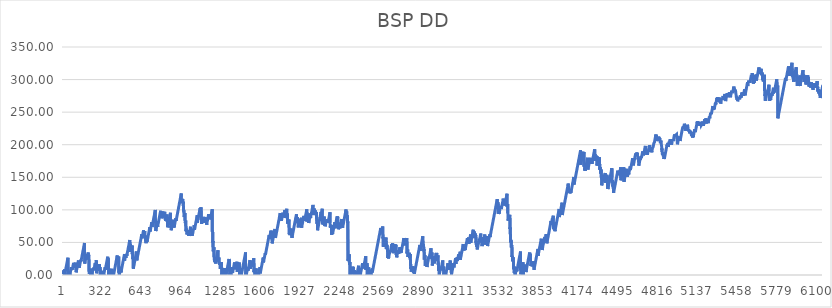
| Category | BSP DD |
|---|---|
| 0 | 1 |
| 1 | 2 |
| 2 | 3 |
| 3 | 4 |
| 4 | 5 |
| 5 | 6 |
| 6 | 7 |
| 7 | 8 |
| 8 | 4.51 |
| 9 | 5.51 |
| 10 | 6.51 |
| 11 | 7.51 |
| 12 | 8.51 |
| 13 | 0 |
| 14 | 1.057 |
| 15 | 2.113 |
| 16 | 3.113 |
| 17 | 4.113 |
| 18 | 5.113 |
| 19 | 6.113 |
| 20 | 7.113 |
| 21 | 8.113 |
| 22 | 9.113 |
| 23 | 10.113 |
| 24 | 11.113 |
| 25 | 12.113 |
| 26 | 13.113 |
| 27 | 14.113 |
| 28 | 15.113 |
| 29 | 16.113 |
| 30 | 17.113 |
| 31 | 18.113 |
| 32 | 19.113 |
| 33 | 20.113 |
| 34 | 21.113 |
| 35 | 22.113 |
| 36 | 23.221 |
| 37 | 24.329 |
| 38 | 25.437 |
| 39 | 26.545 |
| 40 | 0 |
| 41 | 1 |
| 42 | 2 |
| 43 | 3 |
| 44 | 4 |
| 45 | 5 |
| 46 | 6.035 |
| 47 | 0 |
| 48 | 1.035 |
| 49 | 2.07 |
| 50 | 3.122 |
| 51 | 4.175 |
| 52 | 0 |
| 53 | 1.052 |
| 54 | 2.084 |
| 55 | 0 |
| 56 | 1.032 |
| 57 | 2.064 |
| 58 | 3.096 |
| 59 | 4.096 |
| 60 | 5.096 |
| 61 | 6.096 |
| 62 | 7.096 |
| 63 | 8.096 |
| 64 | 9.096 |
| 65 | 10.096 |
| 66 | 11.096 |
| 67 | 12.096 |
| 68 | 13.096 |
| 69 | 7.719 |
| 70 | 8.743 |
| 71 | 9.766 |
| 72 | 10.766 |
| 73 | 11.766 |
| 74 | 12.766 |
| 75 | 8.591 |
| 76 | 9.596 |
| 77 | 10.601 |
| 78 | 11.606 |
| 79 | 12.606 |
| 80 | 13.606 |
| 81 | 14.606 |
| 82 | 15.606 |
| 83 | 16.606 |
| 84 | 17.606 |
| 85 | 18.606 |
| 86 | 19.606 |
| 87 | 12.586 |
| 88 | 13.606 |
| 89 | 14.626 |
| 90 | 15.646 |
| 91 | 10.963 |
| 92 | 11.971 |
| 93 | 12.978 |
| 94 | 13.986 |
| 95 | 14.986 |
| 96 | 15.986 |
| 97 | 16.986 |
| 98 | 17.986 |
| 99 | 18.986 |
| 100 | 13.806 |
| 101 | 14.816 |
| 102 | 15.826 |
| 103 | 16.836 |
| 104 | 17.88 |
| 105 | 18.924 |
| 106 | 4.208 |
| 107 | 5.252 |
| 108 | 6.296 |
| 109 | 7.296 |
| 110 | 8.296 |
| 111 | 9.296 |
| 112 | 10.296 |
| 113 | 11.296 |
| 114 | 12.296 |
| 115 | 13.296 |
| 116 | 14.296 |
| 117 | 15.296 |
| 118 | 16.296 |
| 119 | 17.296 |
| 120 | 18.296 |
| 121 | 19.296 |
| 122 | 20.296 |
| 123 | 21.296 |
| 124 | 22.296 |
| 125 | 15.706 |
| 126 | 16.716 |
| 127 | 17.726 |
| 128 | 18.736 |
| 129 | 19.746 |
| 130 | 20.768 |
| 131 | 11.29 |
| 132 | 12.312 |
| 133 | 13.334 |
| 134 | 14.356 |
| 135 | 15.356 |
| 136 | 16.356 |
| 137 | 17.356 |
| 138 | 18.356 |
| 139 | 19.356 |
| 140 | 20.356 |
| 141 | 21.356 |
| 142 | 22.356 |
| 143 | 23.356 |
| 144 | 24.356 |
| 145 | 20.966 |
| 146 | 21.976 |
| 147 | 22.986 |
| 148 | 23.986 |
| 149 | 24.986 |
| 150 | 25.986 |
| 151 | 26.986 |
| 152 | 27.986 |
| 153 | 28.986 |
| 154 | 29.986 |
| 155 | 30.986 |
| 156 | 31.986 |
| 157 | 32.986 |
| 158 | 33.986 |
| 159 | 34.986 |
| 160 | 35.986 |
| 161 | 36.986 |
| 162 | 37.986 |
| 163 | 38.986 |
| 164 | 39.986 |
| 165 | 40.986 |
| 166 | 41.986 |
| 167 | 42.986 |
| 168 | 43.986 |
| 169 | 44.986 |
| 170 | 45.986 |
| 171 | 46.986 |
| 172 | 48.136 |
| 173 | 49.286 |
| 174 | 50.436 |
| 175 | 17.586 |
| 176 | 18.586 |
| 177 | 19.586 |
| 178 | 20.586 |
| 179 | 21.586 |
| 180 | 22.586 |
| 181 | 23.586 |
| 182 | 24.586 |
| 183 | 25.586 |
| 184 | 26.586 |
| 185 | 27.586 |
| 186 | 28.586 |
| 187 | 29.586 |
| 188 | 24.072 |
| 189 | 25.078 |
| 190 | 26.084 |
| 191 | 27.09 |
| 192 | 28.096 |
| 193 | 29.096 |
| 194 | 30.096 |
| 195 | 31.096 |
| 196 | 32.096 |
| 197 | 28.496 |
| 198 | 29.496 |
| 199 | 30.496 |
| 200 | 31.496 |
| 201 | 32.496 |
| 202 | 33.496 |
| 203 | 34.496 |
| 204 | 26.903 |
| 205 | 27.939 |
| 206 | 28.976 |
| 207 | 30.096 |
| 208 | 31.216 |
| 209 | 32.336 |
| 210 | 5.216 |
| 211 | 6.223 |
| 212 | 1.731 |
| 213 | 2.738 |
| 214 | 3.746 |
| 215 | 4.746 |
| 216 | 5.746 |
| 217 | 6.746 |
| 218 | 7.746 |
| 219 | 8.746 |
| 220 | 9.746 |
| 221 | 10.831 |
| 222 | 1.656 |
| 223 | 2.704 |
| 224 | 0 |
| 225 | 1.048 |
| 226 | 2.096 |
| 227 | 3.144 |
| 228 | 0 |
| 229 | 1.016 |
| 230 | 2.032 |
| 231 | 3.048 |
| 232 | 4.06 |
| 233 | 0 |
| 234 | 1.012 |
| 235 | 2.025 |
| 236 | 3.025 |
| 237 | 4.025 |
| 238 | 5.025 |
| 239 | 6.025 |
| 240 | 7.025 |
| 241 | 8.025 |
| 242 | 9.025 |
| 243 | 10.025 |
| 244 | 7.29 |
| 245 | 8.305 |
| 246 | 9.305 |
| 247 | 10.305 |
| 248 | 11.305 |
| 249 | 12.305 |
| 250 | 8.295 |
| 251 | 9.295 |
| 252 | 10.295 |
| 253 | 11.295 |
| 254 | 12.295 |
| 255 | 13.295 |
| 256 | 14.295 |
| 257 | 15.295 |
| 258 | 16.295 |
| 259 | 17.295 |
| 260 | 18.295 |
| 261 | 14.468 |
| 262 | 15.482 |
| 263 | 16.495 |
| 264 | 17.495 |
| 265 | 18.495 |
| 266 | 19.495 |
| 267 | 20.495 |
| 268 | 21.495 |
| 269 | 22.585 |
| 270 | 23.675 |
| 271 | 2.755 |
| 272 | 3.845 |
| 273 | 4.845 |
| 274 | 5.845 |
| 275 | 6.845 |
| 276 | 7.845 |
| 277 | 8.845 |
| 278 | 9.845 |
| 279 | 10.845 |
| 280 | 11.845 |
| 281 | 12.845 |
| 282 | 13.845 |
| 283 | 14.863 |
| 284 | 6.481 |
| 285 | 7.499 |
| 286 | 8.517 |
| 287 | 9.535 |
| 288 | 10.535 |
| 289 | 11.535 |
| 290 | 12.535 |
| 291 | 13.535 |
| 292 | 14.535 |
| 293 | 15.553 |
| 294 | 16.571 |
| 295 | 8.189 |
| 296 | 9.207 |
| 297 | 10.225 |
| 298 | 11.309 |
| 299 | 12.393 |
| 300 | 13.477 |
| 301 | 0 |
| 302 | 1.084 |
| 303 | 2.084 |
| 304 | 3.084 |
| 305 | 0 |
| 306 | 1.014 |
| 307 | 2.028 |
| 308 | 3.042 |
| 309 | 4.056 |
| 310 | 5.316 |
| 311 | 6.576 |
| 312 | 0 |
| 313 | 0 |
| 314 | 1.006 |
| 315 | 2.012 |
| 316 | 3.018 |
| 317 | 4.024 |
| 318 | 0 |
| 319 | 1.02 |
| 320 | 2.04 |
| 321 | 3.06 |
| 322 | 4.18 |
| 323 | 0 |
| 324 | 1.12 |
| 325 | 2.185 |
| 326 | 3.25 |
| 327 | 4.315 |
| 328 | 0 |
| 329 | 1 |
| 330 | 2 |
| 331 | 3 |
| 332 | 4 |
| 333 | 5 |
| 334 | 6 |
| 335 | 7 |
| 336 | 8 |
| 337 | 9 |
| 338 | 10 |
| 339 | 11 |
| 340 | 12 |
| 341 | 8.113 |
| 342 | 9.127 |
| 343 | 10.14 |
| 344 | 11.14 |
| 345 | 12.14 |
| 346 | 13.14 |
| 347 | 14.14 |
| 348 | 15.14 |
| 349 | 16.14 |
| 350 | 17.14 |
| 351 | 18.14 |
| 352 | 19.14 |
| 353 | 20.14 |
| 354 | 21.14 |
| 355 | 22.14 |
| 356 | 23.14 |
| 357 | 24.14 |
| 358 | 25.14 |
| 359 | 26.14 |
| 360 | 27.14 |
| 361 | 28.14 |
| 362 | 21.373 |
| 363 | 22.407 |
| 364 | 23.44 |
| 365 | 24.63 |
| 366 | 25.82 |
| 367 | 27.01 |
| 368 | 0 |
| 369 | 1.034 |
| 370 | 2.068 |
| 371 | 3.102 |
| 372 | 0 |
| 373 | 1.034 |
| 374 | 2.044 |
| 375 | 0 |
| 376 | 1.01 |
| 377 | 2.02 |
| 378 | 3.03 |
| 379 | 4.03 |
| 380 | 5.03 |
| 381 | 6.03 |
| 382 | 7.03 |
| 383 | 8.04 |
| 384 | 1.65 |
| 385 | 2.66 |
| 386 | 3.67 |
| 387 | 4.68 |
| 388 | 5.68 |
| 389 | 6.68 |
| 390 | 7.68 |
| 391 | 8.68 |
| 392 | 9.68 |
| 393 | 10.76 |
| 394 | 1.84 |
| 395 | 2.84 |
| 396 | 3.84 |
| 397 | 4.84 |
| 398 | 5.84 |
| 399 | 6.868 |
| 400 | 0 |
| 401 | 1.028 |
| 402 | 2.056 |
| 403 | 3.084 |
| 404 | 4.141 |
| 405 | 5.199 |
| 406 | 0 |
| 407 | 1.058 |
| 408 | 0 |
| 409 | 1.02 |
| 410 | 2.04 |
| 411 | 3.04 |
| 412 | 4.04 |
| 413 | 5.04 |
| 414 | 6.04 |
| 415 | 7.04 |
| 416 | 8.04 |
| 417 | 9.04 |
| 418 | 10.04 |
| 419 | 11.04 |
| 420 | 12.04 |
| 421 | 13.04 |
| 422 | 14.04 |
| 423 | 15.04 |
| 424 | 16.04 |
| 425 | 17.04 |
| 426 | 18.04 |
| 427 | 19.04 |
| 428 | 20.04 |
| 429 | 21.04 |
| 430 | 22.04 |
| 431 | 23.04 |
| 432 | 24.04 |
| 433 | 25.04 |
| 434 | 26.04 |
| 435 | 27.04 |
| 436 | 28.04 |
| 437 | 29.04 |
| 438 | 30.04 |
| 439 | 18.062 |
| 440 | 19.094 |
| 441 | 20.126 |
| 442 | 21.158 |
| 443 | 22.19 |
| 444 | 23.19 |
| 445 | 24.19 |
| 446 | 25.19 |
| 447 | 26.278 |
| 448 | 27.366 |
| 449 | 28.454 |
| 450 | 29.542 |
| 451 | 3.63 |
| 452 | 4.63 |
| 453 | 5.63 |
| 454 | 6.63 |
| 455 | 0.445 |
| 456 | 1.46 |
| 457 | 2.475 |
| 458 | 3.49 |
| 459 | 4.49 |
| 460 | 5.49 |
| 461 | 6.49 |
| 462 | 7.49 |
| 463 | 8.49 |
| 464 | 9.49 |
| 465 | 10.49 |
| 466 | 11.49 |
| 467 | 12.565 |
| 468 | 4.04 |
| 469 | 5.04 |
| 470 | 6.04 |
| 471 | 7.04 |
| 472 | 8.04 |
| 473 | 9.04 |
| 474 | 10.04 |
| 475 | 11.04 |
| 476 | 12.04 |
| 477 | 13.04 |
| 478 | 14.04 |
| 479 | 15.04 |
| 480 | 16.04 |
| 481 | 17.04 |
| 482 | 18.04 |
| 483 | 19.04 |
| 484 | 20.04 |
| 485 | 21.04 |
| 486 | 22.04 |
| 487 | 23.04 |
| 488 | 24.04 |
| 489 | 25.04 |
| 490 | 26.04 |
| 491 | 27.04 |
| 492 | 28.04 |
| 493 | 29.04 |
| 494 | 30.04 |
| 495 | 31.04 |
| 496 | 32.064 |
| 497 | 22.088 |
| 498 | 23.112 |
| 499 | 24.136 |
| 500 | 25.16 |
| 501 | 26.16 |
| 502 | 27.16 |
| 503 | 28.16 |
| 504 | 29.16 |
| 505 | 30.16 |
| 506 | 31.16 |
| 507 | 26.37 |
| 508 | 27.38 |
| 509 | 28.39 |
| 510 | 29.4 |
| 511 | 30.4 |
| 512 | 31.4 |
| 513 | 32.4 |
| 514 | 33.402 |
| 515 | 29.715 |
| 516 | 30.717 |
| 517 | 31.72 |
| 518 | 32.72 |
| 519 | 33.72 |
| 520 | 34.72 |
| 521 | 35.72 |
| 522 | 36.72 |
| 523 | 37.72 |
| 524 | 38.72 |
| 525 | 39.72 |
| 526 | 40.72 |
| 527 | 41.72 |
| 528 | 42.72 |
| 529 | 43.72 |
| 530 | 44.72 |
| 531 | 45.72 |
| 532 | 46.72 |
| 533 | 47.72 |
| 534 | 48.72 |
| 535 | 49.72 |
| 536 | 50.72 |
| 537 | 51.72 |
| 538 | 52.72 |
| 539 | 53.752 |
| 540 | 54.785 |
| 541 | 45.317 |
| 542 | 46.35 |
| 543 | 47.417 |
| 544 | 35.483 |
| 545 | 36.55 |
| 546 | 37.55 |
| 547 | 38.55 |
| 548 | 39.55 |
| 549 | 40.55 |
| 550 | 41.55 |
| 551 | 42.55 |
| 552 | 39.25 |
| 553 | 40.25 |
| 554 | 41.25 |
| 555 | 42.25 |
| 556 | 43.25 |
| 557 | 44.288 |
| 558 | 45.326 |
| 559 | 32.064 |
| 560 | 33.102 |
| 561 | 34.14 |
| 562 | 35.172 |
| 563 | 36.204 |
| 564 | 24.386 |
| 565 | 25.418 |
| 566 | 26.45 |
| 567 | 27.506 |
| 568 | 9.802 |
| 569 | 10.858 |
| 570 | 11.914 |
| 571 | 12.97 |
| 572 | 13.97 |
| 573 | 14.97 |
| 574 | 15.97 |
| 575 | 16.97 |
| 576 | 17.97 |
| 577 | 18.97 |
| 578 | 19.97 |
| 579 | 20.97 |
| 580 | 21.97 |
| 581 | 22.97 |
| 582 | 23.97 |
| 583 | 24.97 |
| 584 | 25.97 |
| 585 | 26.97 |
| 586 | 27.97 |
| 587 | 28.97 |
| 588 | 29.97 |
| 589 | 30.97 |
| 590 | 31.97 |
| 591 | 32.97 |
| 592 | 33.97 |
| 593 | 34.97 |
| 594 | 36.028 |
| 595 | 37.085 |
| 596 | 22.542 |
| 597 | 23.6 |
| 598 | 24.6 |
| 599 | 25.6 |
| 600 | 26.6 |
| 601 | 27.6 |
| 602 | 28.6 |
| 603 | 29.6 |
| 604 | 30.6 |
| 605 | 31.6 |
| 606 | 32.6 |
| 607 | 33.6 |
| 608 | 34.6 |
| 609 | 35.6 |
| 610 | 36.6 |
| 611 | 37.6 |
| 612 | 38.6 |
| 613 | 39.6 |
| 614 | 40.6 |
| 615 | 41.6 |
| 616 | 42.6 |
| 617 | 43.6 |
| 618 | 44.6 |
| 619 | 45.6 |
| 620 | 46.6 |
| 621 | 47.6 |
| 622 | 48.6 |
| 623 | 49.6 |
| 624 | 50.6 |
| 625 | 51.6 |
| 626 | 52.6 |
| 627 | 53.6 |
| 628 | 54.6 |
| 629 | 55.6 |
| 630 | 56.6 |
| 631 | 57.6 |
| 632 | 58.6 |
| 633 | 59.6 |
| 634 | 60.6 |
| 635 | 61.6 |
| 636 | 62.6 |
| 637 | 63.62 |
| 638 | 56.44 |
| 639 | 57.46 |
| 640 | 58.48 |
| 641 | 59.48 |
| 642 | 60.48 |
| 643 | 61.48 |
| 644 | 62.48 |
| 645 | 63.48 |
| 646 | 64.48 |
| 647 | 65.48 |
| 648 | 66.48 |
| 649 | 67.48 |
| 650 | 68.515 |
| 651 | 69.55 |
| 652 | 59.565 |
| 653 | 60.6 |
| 654 | 61.6 |
| 655 | 62.6 |
| 656 | 63.6 |
| 657 | 64.6 |
| 658 | 65.6 |
| 659 | 66.62 |
| 660 | 67.64 |
| 661 | 58.66 |
| 662 | 59.68 |
| 663 | 60.7 |
| 664 | 57.94 |
| 665 | 58.96 |
| 666 | 59.988 |
| 667 | 51.745 |
| 668 | 52.772 |
| 669 | 53.8 |
| 670 | 48.93 |
| 671 | 49.94 |
| 672 | 50.95 |
| 673 | 51.96 |
| 674 | 52.96 |
| 675 | 53.96 |
| 676 | 54.96 |
| 677 | 55.96 |
| 678 | 56.96 |
| 679 | 51.372 |
| 680 | 52.385 |
| 681 | 53.398 |
| 682 | 54.41 |
| 683 | 55.41 |
| 684 | 56.41 |
| 685 | 57.41 |
| 686 | 58.41 |
| 687 | 59.41 |
| 688 | 60.41 |
| 689 | 61.41 |
| 690 | 62.41 |
| 691 | 63.41 |
| 692 | 64.41 |
| 693 | 65.41 |
| 694 | 66.41 |
| 695 | 67.41 |
| 696 | 68.41 |
| 697 | 69.41 |
| 698 | 70.41 |
| 699 | 71.41 |
| 700 | 72.41 |
| 701 | 73.41 |
| 702 | 74.447 |
| 703 | 66.883 |
| 704 | 67.92 |
| 705 | 68.92 |
| 706 | 69.92 |
| 707 | 70.92 |
| 708 | 71.92 |
| 709 | 72.92 |
| 710 | 73.92 |
| 711 | 74.92 |
| 712 | 75.92 |
| 713 | 76.92 |
| 714 | 77.92 |
| 715 | 78.92 |
| 716 | 79.92 |
| 717 | 80.936 |
| 718 | 81.952 |
| 719 | 73.738 |
| 720 | 74.754 |
| 721 | 75.77 |
| 722 | 76.77 |
| 723 | 77.77 |
| 724 | 78.77 |
| 725 | 79.77 |
| 726 | 80.77 |
| 727 | 81.77 |
| 728 | 82.77 |
| 729 | 83.77 |
| 730 | 84.77 |
| 731 | 85.77 |
| 732 | 86.77 |
| 733 | 87.77 |
| 734 | 88.77 |
| 735 | 89.77 |
| 736 | 90.77 |
| 737 | 91.77 |
| 738 | 92.77 |
| 739 | 93.77 |
| 740 | 94.77 |
| 741 | 95.77 |
| 742 | 96.77 |
| 743 | 97.77 |
| 744 | 98.77 |
| 745 | 99.96 |
| 746 | 80.15 |
| 747 | 81.237 |
| 748 | 82.323 |
| 749 | 67.41 |
| 750 | 68.41 |
| 751 | 69.41 |
| 752 | 70.41 |
| 753 | 71.41 |
| 754 | 72.41 |
| 755 | 73.41 |
| 756 | 74.41 |
| 757 | 75.41 |
| 758 | 76.41 |
| 759 | 77.41 |
| 760 | 78.41 |
| 761 | 79.41 |
| 762 | 80.41 |
| 763 | 81.422 |
| 764 | 74.524 |
| 765 | 75.536 |
| 766 | 76.548 |
| 767 | 77.56 |
| 768 | 78.56 |
| 769 | 79.56 |
| 770 | 80.56 |
| 771 | 81.56 |
| 772 | 82.56 |
| 773 | 83.56 |
| 774 | 84.56 |
| 775 | 85.56 |
| 776 | 86.56 |
| 777 | 87.56 |
| 778 | 88.56 |
| 779 | 89.56 |
| 780 | 90.56 |
| 781 | 91.56 |
| 782 | 92.56 |
| 783 | 93.56 |
| 784 | 94.56 |
| 785 | 95.56 |
| 786 | 96.56 |
| 787 | 97.56 |
| 788 | 98.56 |
| 789 | 99.56 |
| 790 | 93.1 |
| 791 | 94.11 |
| 792 | 95.12 |
| 793 | 96.13 |
| 794 | 97.14 |
| 795 | 98.168 |
| 796 | 87.196 |
| 797 | 88.224 |
| 798 | 89.252 |
| 799 | 90.28 |
| 800 | 91.28 |
| 801 | 92.28 |
| 802 | 93.28 |
| 803 | 94.28 |
| 804 | 95.28 |
| 805 | 96.3 |
| 806 | 97.32 |
| 807 | 88.5 |
| 808 | 89.52 |
| 809 | 90.54 |
| 810 | 91.54 |
| 811 | 92.54 |
| 812 | 93.54 |
| 813 | 94.54 |
| 814 | 95.54 |
| 815 | 96.54 |
| 816 | 97.54 |
| 817 | 93.042 |
| 818 | 94.044 |
| 819 | 95.046 |
| 820 | 96.048 |
| 821 | 97.05 |
| 822 | 88.673 |
| 823 | 89.717 |
| 824 | 90.76 |
| 825 | 85.34 |
| 826 | 86.35 |
| 827 | 87.36 |
| 828 | 88.37 |
| 829 | 82.916 |
| 830 | 83.922 |
| 831 | 84.928 |
| 832 | 85.934 |
| 833 | 86.94 |
| 834 | 87.94 |
| 835 | 88.94 |
| 836 | 89.94 |
| 837 | 90.94 |
| 838 | 91.974 |
| 839 | 93.008 |
| 840 | 94.042 |
| 841 | 81.596 |
| 842 | 82.63 |
| 843 | 83.66 |
| 844 | 84.69 |
| 845 | 73.22 |
| 846 | 74.25 |
| 847 | 75.28 |
| 848 | 76.28 |
| 849 | 77.28 |
| 850 | 78.28 |
| 851 | 79.28 |
| 852 | 80.28 |
| 853 | 81.28 |
| 854 | 82.28 |
| 855 | 83.28 |
| 856 | 84.28 |
| 857 | 85.28 |
| 858 | 86.28 |
| 859 | 87.28 |
| 860 | 88.28 |
| 861 | 89.28 |
| 862 | 90.28 |
| 863 | 91.28 |
| 864 | 92.33 |
| 865 | 93.38 |
| 866 | 94.43 |
| 867 | 95.48 |
| 868 | 78.88 |
| 869 | 79.9 |
| 870 | 73.12 |
| 871 | 74.14 |
| 872 | 75.16 |
| 873 | 76.174 |
| 874 | 68.808 |
| 875 | 69.822 |
| 876 | 70.836 |
| 877 | 71.85 |
| 878 | 72.85 |
| 879 | 73.85 |
| 880 | 74.85 |
| 881 | 75.85 |
| 882 | 76.85 |
| 883 | 77.85 |
| 884 | 78.85 |
| 885 | 79.85 |
| 886 | 80.85 |
| 887 | 81.85 |
| 888 | 82.85 |
| 889 | 83.85 |
| 890 | 84.85 |
| 891 | 85.85 |
| 892 | 73.384 |
| 893 | 74.418 |
| 894 | 75.452 |
| 895 | 76.486 |
| 896 | 77.52 |
| 897 | 73.128 |
| 898 | 74.135 |
| 899 | 75.143 |
| 900 | 76.15 |
| 901 | 77.15 |
| 902 | 78.15 |
| 903 | 79.15 |
| 904 | 80.15 |
| 905 | 81.15 |
| 906 | 82.15 |
| 907 | 83.15 |
| 908 | 84.15 |
| 909 | 85.15 |
| 910 | 86.15 |
| 911 | 87.15 |
| 912 | 88.15 |
| 913 | 83.12 |
| 914 | 84.13 |
| 915 | 85.14 |
| 916 | 86.15 |
| 917 | 87.15 |
| 918 | 88.15 |
| 919 | 89.15 |
| 920 | 90.15 |
| 921 | 91.15 |
| 922 | 92.15 |
| 923 | 93.15 |
| 924 | 94.15 |
| 925 | 95.15 |
| 926 | 96.15 |
| 927 | 97.15 |
| 928 | 98.15 |
| 929 | 99.15 |
| 930 | 100.15 |
| 931 | 101.15 |
| 932 | 102.15 |
| 933 | 103.15 |
| 934 | 104.15 |
| 935 | 105.15 |
| 936 | 106.15 |
| 937 | 107.15 |
| 938 | 108.15 |
| 939 | 109.15 |
| 940 | 110.15 |
| 941 | 111.15 |
| 942 | 112.15 |
| 943 | 113.15 |
| 944 | 114.15 |
| 945 | 115.15 |
| 946 | 116.15 |
| 947 | 117.15 |
| 948 | 118.15 |
| 949 | 119.15 |
| 950 | 120.15 |
| 951 | 121.15 |
| 952 | 122.15 |
| 953 | 123.15 |
| 954 | 124.15 |
| 955 | 125.196 |
| 956 | 110.742 |
| 957 | 111.788 |
| 958 | 112.834 |
| 959 | 113.834 |
| 960 | 114.834 |
| 961 | 115.834 |
| 962 | 116.834 |
| 963 | 112.376 |
| 964 | 113.378 |
| 965 | 114.38 |
| 966 | 115.382 |
| 967 | 116.384 |
| 968 | 117.398 |
| 969 | 109.932 |
| 970 | 110.946 |
| 971 | 111.96 |
| 972 | 112.974 |
| 973 | 97.861 |
| 974 | 98.947 |
| 975 | 100.034 |
| 976 | 101.084 |
| 977 | 94.914 |
| 978 | 88.899 |
| 979 | 89.914 |
| 980 | 90.929 |
| 981 | 91.944 |
| 982 | 92.98 |
| 983 | 94.016 |
| 984 | 95.052 |
| 985 | 96.088 |
| 986 | 83.344 |
| 987 | 79.624 |
| 988 | 80.624 |
| 989 | 81.624 |
| 990 | 82.624 |
| 991 | 83.624 |
| 992 | 84.686 |
| 993 | 67.078 |
| 994 | 68.14 |
| 995 | 69.14 |
| 996 | 70.14 |
| 997 | 71.14 |
| 998 | 66.29 |
| 999 | 67.3 |
| 1000 | 68.31 |
| 1001 | 69.32 |
| 1002 | 62.332 |
| 1003 | 63.344 |
| 1004 | 64.356 |
| 1005 | 65.368 |
| 1006 | 66.38 |
| 1007 | 67.38 |
| 1008 | 68.38 |
| 1009 | 69.38 |
| 1010 | 64.962 |
| 1011 | 65.964 |
| 1012 | 66.966 |
| 1013 | 67.968 |
| 1014 | 68.97 |
| 1015 | 69.994 |
| 1016 | 60.018 |
| 1017 | 61.042 |
| 1018 | 62.066 |
| 1019 | 63.09 |
| 1020 | 64.09 |
| 1021 | 65.09 |
| 1022 | 66.09 |
| 1023 | 67.09 |
| 1024 | 68.09 |
| 1025 | 69.09 |
| 1026 | 70.09 |
| 1027 | 71.09 |
| 1028 | 72.09 |
| 1029 | 73.13 |
| 1030 | 74.17 |
| 1031 | 60.25 |
| 1032 | 61.29 |
| 1033 | 62.33 |
| 1034 | 63.33 |
| 1035 | 64.33 |
| 1036 | 65.33 |
| 1037 | 66.33 |
| 1038 | 67.33 |
| 1039 | 62.792 |
| 1040 | 63.794 |
| 1041 | 64.796 |
| 1042 | 65.798 |
| 1043 | 66.8 |
| 1044 | 60.51 |
| 1045 | 61.52 |
| 1046 | 62.53 |
| 1047 | 63.54 |
| 1048 | 64.55 |
| 1049 | 65.55 |
| 1050 | 66.55 |
| 1051 | 67.55 |
| 1052 | 68.55 |
| 1053 | 69.55 |
| 1054 | 70.55 |
| 1055 | 71.55 |
| 1056 | 72.55 |
| 1057 | 73.55 |
| 1058 | 74.55 |
| 1059 | 75.55 |
| 1060 | 76.55 |
| 1061 | 77.566 |
| 1062 | 69.702 |
| 1063 | 70.718 |
| 1064 | 71.734 |
| 1065 | 72.75 |
| 1066 | 73.75 |
| 1067 | 74.75 |
| 1068 | 75.75 |
| 1069 | 76.75 |
| 1070 | 77.75 |
| 1071 | 78.75 |
| 1072 | 79.75 |
| 1073 | 80.75 |
| 1074 | 81.75 |
| 1075 | 82.75 |
| 1076 | 83.75 |
| 1077 | 84.75 |
| 1078 | 85.75 |
| 1079 | 86.75 |
| 1080 | 87.75 |
| 1081 | 88.75 |
| 1082 | 89.75 |
| 1083 | 90.75 |
| 1084 | 91.75 |
| 1085 | 80.4 |
| 1086 | 81.43 |
| 1087 | 82.46 |
| 1088 | 83.49 |
| 1089 | 84.52 |
| 1090 | 85.52 |
| 1091 | 86.52 |
| 1092 | 87.52 |
| 1093 | 88.52 |
| 1094 | 89.52 |
| 1095 | 90.52 |
| 1096 | 91.52 |
| 1097 | 92.52 |
| 1098 | 93.52 |
| 1099 | 94.52 |
| 1100 | 95.52 |
| 1101 | 96.52 |
| 1102 | 97.52 |
| 1103 | 98.52 |
| 1104 | 99.52 |
| 1105 | 100.52 |
| 1106 | 101.52 |
| 1107 | 102.52 |
| 1108 | 103.52 |
| 1109 | 97.735 |
| 1110 | 98.75 |
| 1111 | 99.765 |
| 1112 | 100.78 |
| 1113 | 101.78 |
| 1114 | 102.78 |
| 1115 | 103.86 |
| 1116 | 84.7 |
| 1117 | 85.78 |
| 1118 | 86.86 |
| 1119 | 78.503 |
| 1120 | 79.547 |
| 1121 | 80.59 |
| 1122 | 81.59 |
| 1123 | 82.59 |
| 1124 | 83.59 |
| 1125 | 84.59 |
| 1126 | 85.59 |
| 1127 | 86.59 |
| 1128 | 87.59 |
| 1129 | 81.198 |
| 1130 | 82.215 |
| 1131 | 83.233 |
| 1132 | 84.25 |
| 1133 | 85.25 |
| 1134 | 86.25 |
| 1135 | 87.25 |
| 1136 | 88.25 |
| 1137 | 89.25 |
| 1138 | 90.278 |
| 1139 | 80.256 |
| 1140 | 81.284 |
| 1141 | 82.312 |
| 1142 | 83.312 |
| 1143 | 84.312 |
| 1144 | 85.312 |
| 1145 | 86.312 |
| 1146 | 87.312 |
| 1147 | 88.339 |
| 1148 | 82.165 |
| 1149 | 83.192 |
| 1150 | 84.192 |
| 1151 | 85.192 |
| 1152 | 86.192 |
| 1153 | 87.192 |
| 1154 | 88.192 |
| 1155 | 89.212 |
| 1156 | 80.212 |
| 1157 | 81.232 |
| 1158 | 82.252 |
| 1159 | 83.272 |
| 1160 | 77.322 |
| 1161 | 78.372 |
| 1162 | 79.372 |
| 1163 | 80.372 |
| 1164 | 81.372 |
| 1165 | 82.372 |
| 1166 | 83.372 |
| 1167 | 84.372 |
| 1168 | 85.372 |
| 1169 | 86.372 |
| 1170 | 87.372 |
| 1171 | 88.372 |
| 1172 | 89.372 |
| 1173 | 90.372 |
| 1174 | 91.372 |
| 1175 | 92.372 |
| 1176 | 93.372 |
| 1177 | 94.388 |
| 1178 | 86.264 |
| 1179 | 87.28 |
| 1180 | 88.296 |
| 1181 | 89.312 |
| 1182 | 90.312 |
| 1183 | 91.312 |
| 1184 | 92.312 |
| 1185 | 85.434 |
| 1186 | 86.446 |
| 1187 | 87.458 |
| 1188 | 88.47 |
| 1189 | 89.482 |
| 1190 | 90.482 |
| 1191 | 91.482 |
| 1192 | 92.482 |
| 1193 | 88.567 |
| 1194 | 89.572 |
| 1195 | 90.577 |
| 1196 | 91.582 |
| 1197 | 92.582 |
| 1198 | 93.582 |
| 1199 | 94.582 |
| 1200 | 95.582 |
| 1201 | 96.582 |
| 1202 | 97.706 |
| 1203 | 98.83 |
| 1204 | 99.954 |
| 1205 | 101.078 |
| 1206 | 66.252 |
| 1207 | 67.31 |
| 1208 | 68.368 |
| 1209 | 50.036 |
| 1210 | 51.094 |
| 1211 | 52.152 |
| 1212 | 53.222 |
| 1213 | 36.292 |
| 1214 | 37.362 |
| 1215 | 38.432 |
| 1216 | 39.476 |
| 1217 | 40.52 |
| 1218 | 41.564 |
| 1219 | 42.608 |
| 1220 | 27.652 |
| 1221 | 28.658 |
| 1222 | 22.974 |
| 1223 | 23.98 |
| 1224 | 24.986 |
| 1225 | 25.992 |
| 1226 | 19.562 |
| 1227 | 20.572 |
| 1228 | 21.582 |
| 1229 | 22.592 |
| 1230 | 23.602 |
| 1231 | 17.81 |
| 1232 | 18.818 |
| 1233 | 19.826 |
| 1234 | 20.834 |
| 1235 | 21.842 |
| 1236 | 22.842 |
| 1237 | 23.842 |
| 1238 | 24.842 |
| 1239 | 25.842 |
| 1240 | 26.842 |
| 1241 | 27.842 |
| 1242 | 28.842 |
| 1243 | 29.842 |
| 1244 | 30.842 |
| 1245 | 31.842 |
| 1246 | 32.842 |
| 1247 | 33.842 |
| 1248 | 34.842 |
| 1249 | 35.9 |
| 1250 | 36.958 |
| 1251 | 38.016 |
| 1252 | 39.074 |
| 1253 | 20.842 |
| 1254 | 21.842 |
| 1255 | 22.842 |
| 1256 | 23.842 |
| 1257 | 24.842 |
| 1258 | 25.842 |
| 1259 | 26.87 |
| 1260 | 27.898 |
| 1261 | 17.006 |
| 1262 | 18.034 |
| 1263 | 19.062 |
| 1264 | 15.342 |
| 1265 | 16.342 |
| 1266 | 17.342 |
| 1267 | 18.342 |
| 1268 | 19.342 |
| 1269 | 20.37 |
| 1270 | 9.528 |
| 1271 | 10.556 |
| 1272 | 11.584 |
| 1273 | 12.612 |
| 1274 | 13.612 |
| 1275 | 14.612 |
| 1276 | 15.612 |
| 1277 | 16.612 |
| 1278 | 17.612 |
| 1279 | 18.797 |
| 1280 | 19.982 |
| 1281 | 21.167 |
| 1282 | 0 |
| 1283 | 1.12 |
| 1284 | 2.24 |
| 1285 | 0 |
| 1286 | 1.12 |
| 1287 | 2.12 |
| 1288 | 3.12 |
| 1289 | 4.12 |
| 1290 | 5.12 |
| 1291 | 6.12 |
| 1292 | 7.168 |
| 1293 | 8.216 |
| 1294 | 9.264 |
| 1295 | 0 |
| 1296 | 1.048 |
| 1297 | 2.048 |
| 1298 | 3.048 |
| 1299 | 4.048 |
| 1300 | 5.048 |
| 1301 | 6.048 |
| 1302 | 7.148 |
| 1303 | 8.248 |
| 1304 | 9.348 |
| 1305 | 10.448 |
| 1306 | 0 |
| 1307 | 1 |
| 1308 | 2 |
| 1309 | 3 |
| 1310 | 4 |
| 1311 | 5 |
| 1312 | 6 |
| 1313 | 7 |
| 1314 | 8 |
| 1315 | 9.032 |
| 1316 | 10.065 |
| 1317 | 0.637 |
| 1318 | 1.67 |
| 1319 | 2.67 |
| 1320 | 3.67 |
| 1321 | 4.67 |
| 1322 | 5.67 |
| 1323 | 6.67 |
| 1324 | 7.67 |
| 1325 | 8.67 |
| 1326 | 9.67 |
| 1327 | 10.67 |
| 1328 | 11.67 |
| 1329 | 12.67 |
| 1330 | 13.67 |
| 1331 | 14.67 |
| 1332 | 15.67 |
| 1333 | 16.67 |
| 1334 | 17.67 |
| 1335 | 18.67 |
| 1336 | 19.67 |
| 1337 | 20.67 |
| 1338 | 21.67 |
| 1339 | 22.67 |
| 1340 | 23.67 |
| 1341 | 24.67 |
| 1342 | 21.18 |
| 1343 | 22.19 |
| 1344 | 23.2 |
| 1345 | 24.455 |
| 1346 | 0 |
| 1347 | 1.032 |
| 1348 | 2.064 |
| 1349 | 0 |
| 1350 | 1.032 |
| 1351 | 2.064 |
| 1352 | 3.124 |
| 1353 | 4.184 |
| 1354 | 0 |
| 1355 | 1.06 |
| 1356 | 0 |
| 1357 | 1.002 |
| 1358 | 2.005 |
| 1359 | 3.007 |
| 1360 | 4.007 |
| 1361 | 5.007 |
| 1362 | 6.007 |
| 1363 | 7.007 |
| 1364 | 8.007 |
| 1365 | 9.007 |
| 1366 | 10.007 |
| 1367 | 11.007 |
| 1368 | 12.027 |
| 1369 | 3.188 |
| 1370 | 4.207 |
| 1371 | 5.227 |
| 1372 | 6.247 |
| 1373 | 7.247 |
| 1374 | 8.247 |
| 1375 | 9.247 |
| 1376 | 10.247 |
| 1377 | 11.247 |
| 1378 | 12.247 |
| 1379 | 13.247 |
| 1380 | 14.247 |
| 1381 | 15.247 |
| 1382 | 16.247 |
| 1383 | 17.273 |
| 1384 | 18.299 |
| 1385 | 19.325 |
| 1386 | 8.962 |
| 1387 | 9.988 |
| 1388 | 10.988 |
| 1389 | 11.988 |
| 1390 | 12.988 |
| 1391 | 13.988 |
| 1392 | 14.988 |
| 1393 | 15.988 |
| 1394 | 16.988 |
| 1395 | 17.988 |
| 1396 | 18.988 |
| 1397 | 16.341 |
| 1398 | 17.344 |
| 1399 | 18.348 |
| 1400 | 14.248 |
| 1401 | 15.248 |
| 1402 | 16.247 |
| 1403 | 17.248 |
| 1404 | 18.248 |
| 1405 | 19.293 |
| 1406 | 20.339 |
| 1407 | 4.885 |
| 1408 | 5.931 |
| 1409 | 6.977 |
| 1410 | 4.907 |
| 1411 | 5.907 |
| 1412 | 6.907 |
| 1413 | 7.907 |
| 1414 | 8.907 |
| 1415 | 9.907 |
| 1416 | 10.907 |
| 1417 | 11.907 |
| 1418 | 12.907 |
| 1419 | 13.907 |
| 1420 | 14.907 |
| 1421 | 16.005 |
| 1422 | 17.103 |
| 1423 | 18.202 |
| 1424 | 19.3 |
| 1425 | 0 |
| 1426 | 1.078 |
| 1427 | 2.156 |
| 1428 | 3.234 |
| 1429 | 0 |
| 1430 | 1.078 |
| 1431 | 0 |
| 1432 | 1.04 |
| 1433 | 2.08 |
| 1434 | 3.12 |
| 1435 | 4.19 |
| 1436 | 0 |
| 1437 | 1 |
| 1438 | 2 |
| 1439 | 3 |
| 1440 | 0 |
| 1441 | 1.01 |
| 1442 | 2.02 |
| 1443 | 3.02 |
| 1444 | 4.02 |
| 1445 | 5.02 |
| 1446 | 6.02 |
| 1447 | 7.02 |
| 1448 | 8.02 |
| 1449 | 9.02 |
| 1450 | 10.02 |
| 1451 | 11.02 |
| 1452 | 12.02 |
| 1453 | 13.02 |
| 1454 | 14.02 |
| 1455 | 15.02 |
| 1456 | 16.02 |
| 1457 | 17.02 |
| 1458 | 18.02 |
| 1459 | 19.02 |
| 1460 | 20.02 |
| 1461 | 21.02 |
| 1462 | 22.02 |
| 1463 | 23.02 |
| 1464 | 24.02 |
| 1465 | 25.02 |
| 1466 | 26.02 |
| 1467 | 27.02 |
| 1468 | 28.02 |
| 1469 | 29.02 |
| 1470 | 30.02 |
| 1471 | 31.02 |
| 1472 | 32.02 |
| 1473 | 33.37 |
| 1474 | 34.72 |
| 1475 | 0 |
| 1476 | 1 |
| 1477 | 2 |
| 1478 | 3 |
| 1479 | 4 |
| 1480 | 0 |
| 1481 | 1.008 |
| 1482 | 2.016 |
| 1483 | 3.024 |
| 1484 | 4.032 |
| 1485 | 5.032 |
| 1486 | 6.032 |
| 1487 | 7.032 |
| 1488 | 8.032 |
| 1489 | 9.032 |
| 1490 | 10.032 |
| 1491 | 11.032 |
| 1492 | 12.032 |
| 1493 | 13.032 |
| 1494 | 6.762 |
| 1495 | 7.772 |
| 1496 | 8.782 |
| 1497 | 9.792 |
| 1498 | 10.802 |
| 1499 | 11.802 |
| 1500 | 12.802 |
| 1501 | 13.802 |
| 1502 | 14.802 |
| 1503 | 15.802 |
| 1504 | 16.802 |
| 1505 | 17.802 |
| 1506 | 18.802 |
| 1507 | 19.802 |
| 1508 | 20.802 |
| 1509 | 21.802 |
| 1510 | 22.844 |
| 1511 | 23.886 |
| 1512 | 9.428 |
| 1513 | 10.47 |
| 1514 | 11.512 |
| 1515 | 12.512 |
| 1516 | 13.512 |
| 1517 | 14.512 |
| 1518 | 15.512 |
| 1519 | 16.512 |
| 1520 | 17.512 |
| 1521 | 18.512 |
| 1522 | 19.512 |
| 1523 | 20.512 |
| 1524 | 21.53 |
| 1525 | 13.108 |
| 1526 | 14.126 |
| 1527 | 15.144 |
| 1528 | 16.162 |
| 1529 | 13.585 |
| 1530 | 14.589 |
| 1531 | 15.592 |
| 1532 | 16.592 |
| 1533 | 17.592 |
| 1534 | 18.592 |
| 1535 | 19.592 |
| 1536 | 20.592 |
| 1537 | 21.592 |
| 1538 | 22.592 |
| 1539 | 23.684 |
| 1540 | 24.777 |
| 1541 | 25.869 |
| 1542 | 4.372 |
| 1543 | 5.372 |
| 1544 | 6.372 |
| 1545 | 7.372 |
| 1546 | 8.372 |
| 1547 | 9.372 |
| 1548 | 10.562 |
| 1549 | 11.752 |
| 1550 | 0 |
| 1551 | 1 |
| 1552 | 2 |
| 1553 | 3 |
| 1554 | 4 |
| 1555 | 5 |
| 1556 | 6 |
| 1557 | 7 |
| 1558 | 8.043 |
| 1559 | 9.085 |
| 1560 | 10.128 |
| 1561 | 0 |
| 1562 | 1 |
| 1563 | 2 |
| 1564 | 3 |
| 1565 | 4 |
| 1566 | 5.18 |
| 1567 | 0 |
| 1568 | 1 |
| 1569 | 2 |
| 1570 | 3 |
| 1571 | 4 |
| 1572 | 5 |
| 1573 | 0.01 |
| 1574 | 1.02 |
| 1575 | 2.03 |
| 1576 | 3.04 |
| 1577 | 4.092 |
| 1578 | 5.144 |
| 1579 | 0 |
| 1580 | 1.052 |
| 1581 | 2.104 |
| 1582 | 3.104 |
| 1583 | 4.104 |
| 1584 | 5.104 |
| 1585 | 6.104 |
| 1586 | 7.104 |
| 1587 | 8.104 |
| 1588 | 9.104 |
| 1589 | 10.104 |
| 1590 | 11.104 |
| 1591 | 12.104 |
| 1592 | 13.13 |
| 1593 | 2.656 |
| 1594 | 3.682 |
| 1595 | 4.708 |
| 1596 | 5.734 |
| 1597 | 6.734 |
| 1598 | 7.734 |
| 1599 | 8.734 |
| 1600 | 9.734 |
| 1601 | 10.734 |
| 1602 | 11.734 |
| 1603 | 12.734 |
| 1604 | 13.734 |
| 1605 | 14.734 |
| 1606 | 15.734 |
| 1607 | 16.734 |
| 1608 | 17.734 |
| 1609 | 18.734 |
| 1610 | 19.734 |
| 1611 | 20.734 |
| 1612 | 21.734 |
| 1613 | 22.734 |
| 1614 | 23.734 |
| 1615 | 24.734 |
| 1616 | 25.734 |
| 1617 | 26.752 |
| 1618 | 27.77 |
| 1619 | 19.468 |
| 1620 | 20.486 |
| 1621 | 21.504 |
| 1622 | 22.504 |
| 1623 | 23.504 |
| 1624 | 24.504 |
| 1625 | 25.504 |
| 1626 | 26.504 |
| 1627 | 27.504 |
| 1628 | 28.504 |
| 1629 | 29.504 |
| 1630 | 30.504 |
| 1631 | 31.504 |
| 1632 | 32.504 |
| 1633 | 33.504 |
| 1634 | 34.504 |
| 1635 | 31.424 |
| 1636 | 32.444 |
| 1637 | 33.444 |
| 1638 | 34.444 |
| 1639 | 35.444 |
| 1640 | 36.444 |
| 1641 | 37.444 |
| 1642 | 38.444 |
| 1643 | 39.444 |
| 1644 | 40.444 |
| 1645 | 41.444 |
| 1646 | 42.444 |
| 1647 | 43.444 |
| 1648 | 44.444 |
| 1649 | 45.444 |
| 1650 | 46.444 |
| 1651 | 47.444 |
| 1652 | 48.444 |
| 1653 | 49.444 |
| 1654 | 50.444 |
| 1655 | 51.444 |
| 1656 | 52.444 |
| 1657 | 53.444 |
| 1658 | 54.444 |
| 1659 | 55.444 |
| 1660 | 56.444 |
| 1661 | 57.444 |
| 1662 | 58.444 |
| 1663 | 59.444 |
| 1664 | 60.444 |
| 1665 | 61.444 |
| 1666 | 62.444 |
| 1667 | 55.854 |
| 1668 | 56.864 |
| 1669 | 57.874 |
| 1670 | 58.884 |
| 1671 | 59.894 |
| 1672 | 60.894 |
| 1673 | 61.894 |
| 1674 | 62.894 |
| 1675 | 63.894 |
| 1676 | 64.894 |
| 1677 | 65.894 |
| 1678 | 66.894 |
| 1679 | 67.969 |
| 1680 | 59.734 |
| 1681 | 60.734 |
| 1682 | 61.734 |
| 1683 | 62.734 |
| 1684 | 63.734 |
| 1685 | 64.734 |
| 1686 | 65.796 |
| 1687 | 66.858 |
| 1688 | 67.92 |
| 1689 | 48.582 |
| 1690 | 49.644 |
| 1691 | 50.644 |
| 1692 | 51.644 |
| 1693 | 52.644 |
| 1694 | 53.644 |
| 1695 | 54.644 |
| 1696 | 55.644 |
| 1697 | 56.644 |
| 1698 | 57.644 |
| 1699 | 58.644 |
| 1700 | 59.644 |
| 1701 | 60.644 |
| 1702 | 61.644 |
| 1703 | 62.644 |
| 1704 | 63.644 |
| 1705 | 64.644 |
| 1706 | 65.644 |
| 1707 | 66.644 |
| 1708 | 67.644 |
| 1709 | 68.644 |
| 1710 | 69.676 |
| 1711 | 70.708 |
| 1712 | 58.74 |
| 1713 | 59.772 |
| 1714 | 60.804 |
| 1715 | 61.844 |
| 1716 | 57.004 |
| 1717 | 58.004 |
| 1718 | 59.004 |
| 1719 | 60.004 |
| 1720 | 61.004 |
| 1721 | 62.004 |
| 1722 | 63.004 |
| 1723 | 64.004 |
| 1724 | 65.004 |
| 1725 | 66.004 |
| 1726 | 67.004 |
| 1727 | 68.004 |
| 1728 | 69.004 |
| 1729 | 70.004 |
| 1730 | 71.004 |
| 1731 | 72.004 |
| 1732 | 73.004 |
| 1733 | 74.004 |
| 1734 | 75.004 |
| 1735 | 76.004 |
| 1736 | 77.004 |
| 1737 | 78.004 |
| 1738 | 79.004 |
| 1739 | 80.004 |
| 1740 | 81.004 |
| 1741 | 82.004 |
| 1742 | 83.004 |
| 1743 | 84.004 |
| 1744 | 85.004 |
| 1745 | 86.004 |
| 1746 | 87.004 |
| 1747 | 88.004 |
| 1748 | 89.004 |
| 1749 | 90.004 |
| 1750 | 91.004 |
| 1751 | 92.004 |
| 1752 | 93.004 |
| 1753 | 94.004 |
| 1754 | 95.004 |
| 1755 | 96.049 |
| 1756 | 83.984 |
| 1757 | 85.029 |
| 1758 | 86.074 |
| 1759 | 87.074 |
| 1760 | 88.074 |
| 1761 | 89.074 |
| 1762 | 90.074 |
| 1763 | 91.074 |
| 1764 | 83.488 |
| 1765 | 84.502 |
| 1766 | 85.516 |
| 1767 | 86.53 |
| 1768 | 87.544 |
| 1769 | 88.544 |
| 1770 | 89.544 |
| 1771 | 90.544 |
| 1772 | 91.544 |
| 1773 | 92.544 |
| 1774 | 93.544 |
| 1775 | 94.544 |
| 1776 | 95.544 |
| 1777 | 89.164 |
| 1778 | 90.174 |
| 1779 | 91.184 |
| 1780 | 92.194 |
| 1781 | 93.204 |
| 1782 | 89.806 |
| 1783 | 90.809 |
| 1784 | 91.811 |
| 1785 | 92.814 |
| 1786 | 93.814 |
| 1787 | 94.814 |
| 1788 | 95.814 |
| 1789 | 96.814 |
| 1790 | 97.814 |
| 1791 | 98.861 |
| 1792 | 99.909 |
| 1793 | 87.456 |
| 1794 | 88.504 |
| 1795 | 89.504 |
| 1796 | 90.504 |
| 1797 | 91.504 |
| 1798 | 92.504 |
| 1799 | 93.504 |
| 1800 | 94.504 |
| 1801 | 95.504 |
| 1802 | 96.504 |
| 1803 | 97.504 |
| 1804 | 98.504 |
| 1805 | 99.534 |
| 1806 | 100.564 |
| 1807 | 101.594 |
| 1808 | 90.124 |
| 1809 | 91.154 |
| 1810 | 92.204 |
| 1811 | 93.254 |
| 1812 | 94.304 |
| 1813 | 95.354 |
| 1814 | 78.904 |
| 1815 | 79.904 |
| 1816 | 80.904 |
| 1817 | 81.904 |
| 1818 | 82.904 |
| 1819 | 79.104 |
| 1820 | 80.104 |
| 1821 | 81.104 |
| 1822 | 82.104 |
| 1823 | 83.104 |
| 1824 | 84.184 |
| 1825 | 85.264 |
| 1826 | 86.344 |
| 1827 | 62.424 |
| 1828 | 63.504 |
| 1829 | 64.504 |
| 1830 | 65.504 |
| 1831 | 66.504 |
| 1832 | 67.504 |
| 1833 | 68.504 |
| 1834 | 61.218 |
| 1835 | 62.232 |
| 1836 | 63.246 |
| 1837 | 64.26 |
| 1838 | 65.274 |
| 1839 | 66.274 |
| 1840 | 67.274 |
| 1841 | 68.274 |
| 1842 | 69.274 |
| 1843 | 70.274 |
| 1844 | 71.294 |
| 1845 | 62.314 |
| 1846 | 63.334 |
| 1847 | 64.354 |
| 1848 | 65.374 |
| 1849 | 57.062 |
| 1850 | 58.08 |
| 1851 | 59.098 |
| 1852 | 60.116 |
| 1853 | 61.134 |
| 1854 | 62.134 |
| 1855 | 63.134 |
| 1856 | 64.134 |
| 1857 | 65.134 |
| 1858 | 66.134 |
| 1859 | 67.134 |
| 1860 | 68.134 |
| 1861 | 69.134 |
| 1862 | 70.134 |
| 1863 | 71.134 |
| 1864 | 72.134 |
| 1865 | 73.134 |
| 1866 | 74.134 |
| 1867 | 75.134 |
| 1868 | 76.134 |
| 1869 | 77.134 |
| 1870 | 78.134 |
| 1871 | 79.134 |
| 1872 | 80.134 |
| 1873 | 81.134 |
| 1874 | 82.134 |
| 1875 | 83.134 |
| 1876 | 84.134 |
| 1877 | 85.134 |
| 1878 | 86.134 |
| 1879 | 87.134 |
| 1880 | 88.134 |
| 1881 | 89.134 |
| 1882 | 90.134 |
| 1883 | 91.134 |
| 1884 | 92.168 |
| 1885 | 93.202 |
| 1886 | 80.736 |
| 1887 | 81.77 |
| 1888 | 82.804 |
| 1889 | 83.804 |
| 1890 | 84.804 |
| 1891 | 85.804 |
| 1892 | 86.804 |
| 1893 | 87.804 |
| 1894 | 88.824 |
| 1895 | 89.844 |
| 1896 | 80.864 |
| 1897 | 81.884 |
| 1898 | 82.904 |
| 1899 | 84.004 |
| 1900 | 73.144 |
| 1901 | 74.144 |
| 1902 | 75.144 |
| 1903 | 76.144 |
| 1904 | 77.144 |
| 1905 | 78.144 |
| 1906 | 79.144 |
| 1907 | 80.144 |
| 1908 | 81.144 |
| 1909 | 82.144 |
| 1910 | 76.5 |
| 1911 | 77.506 |
| 1912 | 78.512 |
| 1913 | 79.518 |
| 1914 | 80.524 |
| 1915 | 81.524 |
| 1916 | 82.524 |
| 1917 | 83.524 |
| 1918 | 84.524 |
| 1919 | 85.524 |
| 1920 | 86.524 |
| 1921 | 87.524 |
| 1922 | 83.677 |
| 1923 | 84.691 |
| 1924 | 85.704 |
| 1925 | 86.764 |
| 1926 | 87.824 |
| 1927 | 72.714 |
| 1928 | 73.774 |
| 1929 | 74.774 |
| 1930 | 75.774 |
| 1931 | 76.774 |
| 1932 | 77.774 |
| 1933 | 78.774 |
| 1934 | 79.774 |
| 1935 | 80.774 |
| 1936 | 81.774 |
| 1937 | 82.774 |
| 1938 | 83.774 |
| 1939 | 84.774 |
| 1940 | 85.774 |
| 1941 | 86.774 |
| 1942 | 87.774 |
| 1943 | 88.774 |
| 1944 | 89.774 |
| 1945 | 90.774 |
| 1946 | 91.774 |
| 1947 | 84.794 |
| 1948 | 85.814 |
| 1949 | 86.834 |
| 1950 | 87.854 |
| 1951 | 82.888 |
| 1952 | 83.892 |
| 1953 | 84.896 |
| 1954 | 85.9 |
| 1955 | 86.904 |
| 1956 | 87.904 |
| 1957 | 88.904 |
| 1958 | 89.904 |
| 1959 | 90.904 |
| 1960 | 91.904 |
| 1961 | 92.904 |
| 1962 | 93.904 |
| 1963 | 94.904 |
| 1964 | 95.904 |
| 1965 | 96.904 |
| 1966 | 97.904 |
| 1967 | 98.904 |
| 1968 | 99.904 |
| 1969 | 100.904 |
| 1970 | 102.024 |
| 1971 | 82.144 |
| 1972 | 83.264 |
| 1973 | 84.264 |
| 1974 | 85.264 |
| 1975 | 86.264 |
| 1976 | 87.264 |
| 1977 | 88.264 |
| 1978 | 89.264 |
| 1979 | 90.264 |
| 1980 | 91.264 |
| 1981 | 92.264 |
| 1982 | 93.306 |
| 1983 | 94.348 |
| 1984 | 79.89 |
| 1985 | 80.932 |
| 1986 | 81.974 |
| 1987 | 82.974 |
| 1988 | 83.974 |
| 1989 | 84.974 |
| 1990 | 85.974 |
| 1991 | 86.974 |
| 1992 | 87.974 |
| 1993 | 88.974 |
| 1994 | 89.974 |
| 1995 | 90.974 |
| 1996 | 91.974 |
| 1997 | 92.974 |
| 1998 | 93.974 |
| 1999 | 87.484 |
| 2000 | 88.514 |
| 2001 | 89.544 |
| 2002 | 90.544 |
| 2003 | 91.544 |
| 2004 | 92.544 |
| 2005 | 93.544 |
| 2006 | 94.544 |
| 2007 | 95.544 |
| 2008 | 96.544 |
| 2009 | 97.544 |
| 2010 | 98.544 |
| 2011 | 99.544 |
| 2012 | 100.544 |
| 2013 | 101.544 |
| 2014 | 102.544 |
| 2015 | 103.544 |
| 2016 | 104.544 |
| 2017 | 105.544 |
| 2018 | 106.59 |
| 2019 | 107.636 |
| 2020 | 91.992 |
| 2021 | 93.038 |
| 2022 | 94.084 |
| 2023 | 95.084 |
| 2024 | 96.084 |
| 2025 | 97.084 |
| 2026 | 98.084 |
| 2027 | 99.084 |
| 2028 | 100.084 |
| 2029 | 101.084 |
| 2030 | 102.084 |
| 2031 | 93.131 |
| 2032 | 94.177 |
| 2033 | 95.224 |
| 2034 | 96.224 |
| 2035 | 97.224 |
| 2036 | 98.224 |
| 2037 | 99.224 |
| 2038 | 100.224 |
| 2039 | 95.044 |
| 2040 | 96.064 |
| 2041 | 97.084 |
| 2042 | 92.476 |
| 2043 | 93.478 |
| 2044 | 94.48 |
| 2045 | 95.482 |
| 2046 | 96.484 |
| 2047 | 86.854 |
| 2048 | 87.904 |
| 2049 | 88.954 |
| 2050 | 90.017 |
| 2051 | 78.581 |
| 2052 | 79.644 |
| 2053 | 80.684 |
| 2054 | 81.724 |
| 2055 | 82.764 |
| 2056 | 68.754 |
| 2057 | 69.794 |
| 2058 | 70.794 |
| 2059 | 71.794 |
| 2060 | 72.794 |
| 2061 | 73.794 |
| 2062 | 74.794 |
| 2063 | 75.794 |
| 2064 | 76.794 |
| 2065 | 77.794 |
| 2066 | 78.794 |
| 2067 | 79.794 |
| 2068 | 80.794 |
| 2069 | 81.794 |
| 2070 | 82.794 |
| 2071 | 83.794 |
| 2072 | 84.794 |
| 2073 | 85.794 |
| 2074 | 86.794 |
| 2075 | 87.794 |
| 2076 | 88.794 |
| 2077 | 89.794 |
| 2078 | 90.794 |
| 2079 | 91.794 |
| 2080 | 92.794 |
| 2081 | 93.794 |
| 2082 | 94.794 |
| 2083 | 95.794 |
| 2084 | 96.794 |
| 2085 | 97.794 |
| 2086 | 93.496 |
| 2087 | 94.498 |
| 2088 | 95.5 |
| 2089 | 96.502 |
| 2090 | 97.504 |
| 2091 | 98.504 |
| 2092 | 99.504 |
| 2093 | 100.596 |
| 2094 | 101.689 |
| 2095 | 80.431 |
| 2096 | 81.524 |
| 2097 | 77.599 |
| 2098 | 78.604 |
| 2099 | 79.609 |
| 2100 | 80.614 |
| 2101 | 81.614 |
| 2102 | 82.614 |
| 2103 | 83.614 |
| 2104 | 84.614 |
| 2105 | 85.614 |
| 2106 | 86.614 |
| 2107 | 87.614 |
| 2108 | 88.614 |
| 2109 | 89.658 |
| 2110 | 90.702 |
| 2111 | 75.746 |
| 2112 | 76.79 |
| 2113 | 77.834 |
| 2114 | 78.834 |
| 2115 | 79.834 |
| 2116 | 80.834 |
| 2117 | 81.834 |
| 2118 | 74.854 |
| 2119 | 75.874 |
| 2120 | 76.894 |
| 2121 | 77.914 |
| 2122 | 78.914 |
| 2123 | 79.914 |
| 2124 | 80.914 |
| 2125 | 81.914 |
| 2126 | 82.914 |
| 2127 | 83.914 |
| 2128 | 84.914 |
| 2129 | 81.114 |
| 2130 | 82.114 |
| 2131 | 83.114 |
| 2132 | 84.114 |
| 2133 | 85.114 |
| 2134 | 80.934 |
| 2135 | 81.934 |
| 2136 | 82.934 |
| 2137 | 83.934 |
| 2138 | 84.934 |
| 2139 | 85.949 |
| 2140 | 79.964 |
| 2141 | 80.979 |
| 2142 | 81.994 |
| 2143 | 82.994 |
| 2144 | 83.994 |
| 2145 | 84.994 |
| 2146 | 85.994 |
| 2147 | 86.994 |
| 2148 | 87.994 |
| 2149 | 88.994 |
| 2150 | 89.994 |
| 2151 | 90.994 |
| 2152 | 91.994 |
| 2153 | 92.994 |
| 2154 | 93.994 |
| 2155 | 95.087 |
| 2156 | 96.181 |
| 2157 | 80.314 |
| 2158 | 72.918 |
| 2159 | 73.932 |
| 2160 | 74.946 |
| 2161 | 75.96 |
| 2162 | 76.974 |
| 2163 | 77.98 |
| 2164 | 72.496 |
| 2165 | 73.502 |
| 2166 | 74.508 |
| 2167 | 75.514 |
| 2168 | 76.556 |
| 2169 | 61.958 |
| 2170 | 63 |
| 2171 | 64.042 |
| 2172 | 65.084 |
| 2173 | 66.084 |
| 2174 | 67.084 |
| 2175 | 68.084 |
| 2176 | 69.084 |
| 2177 | 62.934 |
| 2178 | 63.984 |
| 2179 | 64.984 |
| 2180 | 65.984 |
| 2181 | 66.984 |
| 2182 | 67.984 |
| 2183 | 68.984 |
| 2184 | 69.984 |
| 2185 | 70.984 |
| 2186 | 71.984 |
| 2187 | 72.984 |
| 2188 | 73.984 |
| 2189 | 74.984 |
| 2190 | 75.984 |
| 2191 | 76.984 |
| 2192 | 77.984 |
| 2193 | 78.984 |
| 2194 | 79.984 |
| 2195 | 81.004 |
| 2196 | 71.884 |
| 2197 | 72.904 |
| 2198 | 73.924 |
| 2199 | 74.944 |
| 2200 | 75.944 |
| 2201 | 76.944 |
| 2202 | 77.944 |
| 2203 | 78.944 |
| 2204 | 79.944 |
| 2205 | 80.944 |
| 2206 | 81.944 |
| 2207 | 82.944 |
| 2208 | 83.944 |
| 2209 | 84.944 |
| 2210 | 85.944 |
| 2211 | 86.944 |
| 2212 | 87.944 |
| 2213 | 88.944 |
| 2214 | 89.944 |
| 2215 | 85.391 |
| 2216 | 86.407 |
| 2217 | 87.424 |
| 2218 | 88.478 |
| 2219 | 89.532 |
| 2220 | 72.326 |
| 2221 | 73.38 |
| 2222 | 74.434 |
| 2223 | 75.434 |
| 2224 | 76.434 |
| 2225 | 70.352 |
| 2226 | 71.36 |
| 2227 | 72.368 |
| 2228 | 73.376 |
| 2229 | 74.384 |
| 2230 | 75.384 |
| 2231 | 76.384 |
| 2232 | 77.384 |
| 2233 | 78.384 |
| 2234 | 79.384 |
| 2235 | 80.402 |
| 2236 | 71.85 |
| 2237 | 72.868 |
| 2238 | 73.886 |
| 2239 | 74.904 |
| 2240 | 75.904 |
| 2241 | 76.904 |
| 2242 | 77.904 |
| 2243 | 78.904 |
| 2244 | 79.904 |
| 2245 | 80.904 |
| 2246 | 81.904 |
| 2247 | 82.904 |
| 2248 | 83.904 |
| 2249 | 84.904 |
| 2250 | 85.918 |
| 2251 | 78.532 |
| 2252 | 79.546 |
| 2253 | 80.56 |
| 2254 | 81.574 |
| 2255 | 82.606 |
| 2256 | 83.638 |
| 2257 | 84.67 |
| 2258 | 72.612 |
| 2259 | 73.644 |
| 2260 | 74.644 |
| 2261 | 75.644 |
| 2262 | 76.644 |
| 2263 | 77.644 |
| 2264 | 78.644 |
| 2265 | 79.644 |
| 2266 | 80.644 |
| 2267 | 81.644 |
| 2268 | 82.644 |
| 2269 | 83.644 |
| 2270 | 84.644 |
| 2271 | 85.644 |
| 2272 | 86.644 |
| 2273 | 87.644 |
| 2274 | 88.644 |
| 2275 | 89.644 |
| 2276 | 90.644 |
| 2277 | 91.644 |
| 2278 | 92.644 |
| 2279 | 93.644 |
| 2280 | 94.644 |
| 2281 | 95.644 |
| 2282 | 96.644 |
| 2283 | 97.644 |
| 2284 | 98.644 |
| 2285 | 99.644 |
| 2286 | 100.664 |
| 2287 | 93.544 |
| 2288 | 94.564 |
| 2289 | 95.584 |
| 2290 | 96.608 |
| 2291 | 97.632 |
| 2292 | 87.656 |
| 2293 | 88.68 |
| 2294 | 89.704 |
| 2295 | 90.74 |
| 2296 | 91.776 |
| 2297 | 92.812 |
| 2298 | 79.848 |
| 2299 | 80.884 |
| 2300 | 82.287 |
| 2301 | 83.691 |
| 2302 | 21.804 |
| 2303 | 22.804 |
| 2304 | 23.804 |
| 2305 | 24.804 |
| 2306 | 25.804 |
| 2307 | 26.804 |
| 2308 | 27.804 |
| 2309 | 28.804 |
| 2310 | 29.852 |
| 2311 | 30.9 |
| 2312 | 31.948 |
| 2313 | 15.746 |
| 2314 | 16.794 |
| 2315 | 17.794 |
| 2316 | 18.794 |
| 2317 | 19.794 |
| 2318 | 20.927 |
| 2319 | 0 |
| 2320 | 1.133 |
| 2321 | 2.133 |
| 2322 | 3.133 |
| 2323 | 4.133 |
| 2324 | 5.133 |
| 2325 | 6.133 |
| 2326 | 7.163 |
| 2327 | 0.793 |
| 2328 | 1.823 |
| 2329 | 2.823 |
| 2330 | 3.823 |
| 2331 | 4.823 |
| 2332 | 5.823 |
| 2333 | 6.823 |
| 2334 | 7.823 |
| 2335 | 8.823 |
| 2336 | 9.823 |
| 2337 | 10.823 |
| 2338 | 11.823 |
| 2339 | 12.823 |
| 2340 | 8.351 |
| 2341 | 9.358 |
| 2342 | 10.366 |
| 2343 | 11.373 |
| 2344 | 12.405 |
| 2345 | 13.437 |
| 2346 | 1.679 |
| 2347 | 2.711 |
| 2348 | 3.743 |
| 2349 | 4.743 |
| 2350 | 5.743 |
| 2351 | 6.743 |
| 2352 | 7.743 |
| 2353 | 8.743 |
| 2354 | 0 |
| 2355 | 1.022 |
| 2356 | 2.044 |
| 2357 | 3.066 |
| 2358 | 4.088 |
| 2359 | 5.15 |
| 2360 | 6.212 |
| 2361 | 7.274 |
| 2362 | 0 |
| 2363 | 1.062 |
| 2364 | 2.062 |
| 2365 | 3.062 |
| 2366 | 4.114 |
| 2367 | 5.166 |
| 2368 | 0 |
| 2369 | 1.052 |
| 2370 | 2.104 |
| 2371 | 0 |
| 2372 | 1.045 |
| 2373 | 0 |
| 2374 | 1.002 |
| 2375 | 2.005 |
| 2376 | 3.007 |
| 2377 | 4.007 |
| 2378 | 5.007 |
| 2379 | 6.007 |
| 2380 | 7.007 |
| 2381 | 8.007 |
| 2382 | 9.007 |
| 2383 | 10.007 |
| 2384 | 11.007 |
| 2385 | 12.007 |
| 2386 | 13.142 |
| 2387 | 14.277 |
| 2388 | 15.412 |
| 2389 | 0 |
| 2390 | 1 |
| 2391 | 2 |
| 2392 | 3 |
| 2393 | 4 |
| 2394 | 5 |
| 2395 | 6 |
| 2396 | 7 |
| 2397 | 8 |
| 2398 | 9.042 |
| 2399 | 10.084 |
| 2400 | 11.126 |
| 2401 | 0 |
| 2402 | 1.042 |
| 2403 | 2.042 |
| 2404 | 3.042 |
| 2405 | 4.042 |
| 2406 | 5.042 |
| 2407 | 6.042 |
| 2408 | 7.042 |
| 2409 | 8.042 |
| 2410 | 9.042 |
| 2411 | 10.042 |
| 2412 | 11.042 |
| 2413 | 12.042 |
| 2414 | 13.042 |
| 2415 | 14.042 |
| 2416 | 15.042 |
| 2417 | 16.042 |
| 2418 | 17.042 |
| 2419 | 18.042 |
| 2420 | 10.262 |
| 2421 | 11.282 |
| 2422 | 12.302 |
| 2423 | 13.322 |
| 2424 | 14.322 |
| 2425 | 15.322 |
| 2426 | 16.322 |
| 2427 | 10.569 |
| 2428 | 11.595 |
| 2429 | 12.622 |
| 2430 | 13.622 |
| 2431 | 14.622 |
| 2432 | 15.622 |
| 2433 | 16.622 |
| 2434 | 17.622 |
| 2435 | 18.622 |
| 2436 | 19.622 |
| 2437 | 20.622 |
| 2438 | 21.622 |
| 2439 | 22.622 |
| 2440 | 23.622 |
| 2441 | 24.622 |
| 2442 | 25.69 |
| 2443 | 26.758 |
| 2444 | 27.826 |
| 2445 | 28.894 |
| 2446 | 8.142 |
| 2447 | 9.142 |
| 2448 | 10.142 |
| 2449 | 11.142 |
| 2450 | 12.142 |
| 2451 | 13.142 |
| 2452 | 14.142 |
| 2453 | 15.142 |
| 2454 | 16.252 |
| 2455 | 17.362 |
| 2456 | 18.472 |
| 2457 | 0 |
| 2458 | 1 |
| 2459 | 2 |
| 2460 | 3 |
| 2461 | 4 |
| 2462 | 5 |
| 2463 | 6 |
| 2464 | 7 |
| 2465 | 8 |
| 2466 | 9 |
| 2467 | 10 |
| 2468 | 11 |
| 2469 | 12 |
| 2470 | 13.295 |
| 2471 | 0 |
| 2472 | 1 |
| 2473 | 2 |
| 2474 | 3 |
| 2475 | 4 |
| 2476 | 5 |
| 2477 | 6 |
| 2478 | 7 |
| 2479 | 8 |
| 2480 | 9 |
| 2481 | 2.63 |
| 2482 | 3.66 |
| 2483 | 4.69 |
| 2484 | 0 |
| 2485 | 1.033 |
| 2486 | 2.067 |
| 2487 | 0 |
| 2488 | 1.005 |
| 2489 | 2.01 |
| 2490 | 3.015 |
| 2491 | 4.015 |
| 2492 | 5.015 |
| 2493 | 6.015 |
| 2494 | 7.015 |
| 2495 | 8.015 |
| 2496 | 9.015 |
| 2497 | 10.023 |
| 2498 | 4.041 |
| 2499 | 5.049 |
| 2500 | 6.057 |
| 2501 | 7.065 |
| 2502 | 8.065 |
| 2503 | 9.065 |
| 2504 | 10.065 |
| 2505 | 11.065 |
| 2506 | 12.065 |
| 2507 | 13.065 |
| 2508 | 14.065 |
| 2509 | 15.065 |
| 2510 | 16.065 |
| 2511 | 17.065 |
| 2512 | 18.065 |
| 2513 | 19.065 |
| 2514 | 20.065 |
| 2515 | 21.065 |
| 2516 | 22.065 |
| 2517 | 23.065 |
| 2518 | 24.065 |
| 2519 | 25.065 |
| 2520 | 26.065 |
| 2521 | 27.065 |
| 2522 | 28.065 |
| 2523 | 29.065 |
| 2524 | 30.065 |
| 2525 | 31.065 |
| 2526 | 32.065 |
| 2527 | 33.065 |
| 2528 | 34.065 |
| 2529 | 35.065 |
| 2530 | 36.065 |
| 2531 | 37.065 |
| 2532 | 38.065 |
| 2533 | 39.065 |
| 2534 | 40.065 |
| 2535 | 41.065 |
| 2536 | 42.065 |
| 2537 | 43.065 |
| 2538 | 44.065 |
| 2539 | 45.065 |
| 2540 | 46.065 |
| 2541 | 47.065 |
| 2542 | 48.065 |
| 2543 | 49.065 |
| 2544 | 50.065 |
| 2545 | 51.065 |
| 2546 | 52.065 |
| 2547 | 53.065 |
| 2548 | 54.065 |
| 2549 | 55.065 |
| 2550 | 56.065 |
| 2551 | 57.065 |
| 2552 | 58.065 |
| 2553 | 59.065 |
| 2554 | 60.065 |
| 2555 | 61.065 |
| 2556 | 62.065 |
| 2557 | 63.065 |
| 2558 | 64.065 |
| 2559 | 65.065 |
| 2560 | 66.065 |
| 2561 | 67.065 |
| 2562 | 68.065 |
| 2563 | 69.065 |
| 2564 | 70.065 |
| 2565 | 71.065 |
| 2566 | 72.081 |
| 2567 | 64.317 |
| 2568 | 65.333 |
| 2569 | 66.349 |
| 2570 | 67.365 |
| 2571 | 68.365 |
| 2572 | 69.365 |
| 2573 | 70.365 |
| 2574 | 71.365 |
| 2575 | 72.365 |
| 2576 | 68.39 |
| 2577 | 69.395 |
| 2578 | 70.4 |
| 2579 | 71.405 |
| 2580 | 72.467 |
| 2581 | 73.529 |
| 2582 | 74.591 |
| 2583 | 75.653 |
| 2584 | 56.085 |
| 2585 | 57.129 |
| 2586 | 58.173 |
| 2587 | 43.267 |
| 2588 | 44.311 |
| 2589 | 45.355 |
| 2590 | 46.355 |
| 2591 | 47.355 |
| 2592 | 48.355 |
| 2593 | 49.355 |
| 2594 | 50.355 |
| 2595 | 43.367 |
| 2596 | 44.379 |
| 2597 | 45.391 |
| 2598 | 46.403 |
| 2599 | 47.415 |
| 2600 | 48.415 |
| 2601 | 49.415 |
| 2602 | 50.415 |
| 2603 | 51.415 |
| 2604 | 52.415 |
| 2605 | 53.415 |
| 2606 | 54.415 |
| 2607 | 55.415 |
| 2608 | 56.415 |
| 2609 | 57.415 |
| 2610 | 58.415 |
| 2611 | 40.155 |
| 2612 | 41.265 |
| 2613 | 42.375 |
| 2614 | 43.375 |
| 2615 | 44.375 |
| 2616 | 45.375 |
| 2617 | 46.375 |
| 2618 | 47.418 |
| 2619 | 39.142 |
| 2620 | 40.185 |
| 2621 | 41.252 |
| 2622 | 42.32 |
| 2623 | 26.087 |
| 2624 | 27.155 |
| 2625 | 28.155 |
| 2626 | 29.155 |
| 2627 | 30.155 |
| 2628 | 31.155 |
| 2629 | 25.497 |
| 2630 | 26.51 |
| 2631 | 27.522 |
| 2632 | 28.535 |
| 2633 | 29.535 |
| 2634 | 30.535 |
| 2635 | 31.535 |
| 2636 | 32.535 |
| 2637 | 33.535 |
| 2638 | 34.535 |
| 2639 | 35.535 |
| 2640 | 36.535 |
| 2641 | 37.535 |
| 2642 | 38.535 |
| 2643 | 35.165 |
| 2644 | 36.165 |
| 2645 | 37.165 |
| 2646 | 38.165 |
| 2647 | 39.165 |
| 2648 | 40.165 |
| 2649 | 41.165 |
| 2650 | 42.165 |
| 2651 | 43.165 |
| 2652 | 44.165 |
| 2653 | 45.165 |
| 2654 | 46.165 |
| 2655 | 47.165 |
| 2656 | 48.165 |
| 2657 | 44.767 |
| 2658 | 45.77 |
| 2659 | 46.772 |
| 2660 | 47.775 |
| 2661 | 48.807 |
| 2662 | 49.839 |
| 2663 | 37.871 |
| 2664 | 38.903 |
| 2665 | 39.935 |
| 2666 | 40.935 |
| 2667 | 41.935 |
| 2668 | 33.562 |
| 2669 | 34.59 |
| 2670 | 35.617 |
| 2671 | 36.645 |
| 2672 | 37.645 |
| 2673 | 38.645 |
| 2674 | 39.645 |
| 2675 | 40.645 |
| 2676 | 41.645 |
| 2677 | 42.645 |
| 2678 | 43.645 |
| 2679 | 44.645 |
| 2680 | 45.645 |
| 2681 | 46.682 |
| 2682 | 47.718 |
| 2683 | 40.235 |
| 2684 | 41.235 |
| 2685 | 42.235 |
| 2686 | 43.235 |
| 2687 | 44.235 |
| 2688 | 45.235 |
| 2689 | 46.302 |
| 2690 | 47.37 |
| 2691 | 30.937 |
| 2692 | 32.005 |
| 2693 | 33.025 |
| 2694 | 34.045 |
| 2695 | 27.185 |
| 2696 | 28.205 |
| 2697 | 29.205 |
| 2698 | 30.205 |
| 2699 | 31.205 |
| 2700 | 32.205 |
| 2701 | 33.205 |
| 2702 | 34.205 |
| 2703 | 35.205 |
| 2704 | 36.205 |
| 2705 | 37.205 |
| 2706 | 38.205 |
| 2707 | 35.495 |
| 2708 | 36.495 |
| 2709 | 37.495 |
| 2710 | 38.495 |
| 2711 | 32.722 |
| 2712 | 33.748 |
| 2713 | 34.775 |
| 2714 | 35.775 |
| 2715 | 36.775 |
| 2716 | 37.775 |
| 2717 | 38.775 |
| 2718 | 39.775 |
| 2719 | 40.775 |
| 2720 | 41.775 |
| 2721 | 42.775 |
| 2722 | 33.795 |
| 2723 | 34.815 |
| 2724 | 35.835 |
| 2725 | 36.855 |
| 2726 | 37.875 |
| 2727 | 38.875 |
| 2728 | 39.875 |
| 2729 | 40.875 |
| 2730 | 41.875 |
| 2731 | 34.599 |
| 2732 | 35.613 |
| 2733 | 36.627 |
| 2734 | 37.641 |
| 2735 | 38.655 |
| 2736 | 39.655 |
| 2737 | 40.655 |
| 2738 | 41.655 |
| 2739 | 42.655 |
| 2740 | 43.655 |
| 2741 | 44.655 |
| 2742 | 45.655 |
| 2743 | 46.655 |
| 2744 | 47.655 |
| 2745 | 48.655 |
| 2746 | 49.655 |
| 2747 | 50.655 |
| 2748 | 51.655 |
| 2749 | 52.655 |
| 2750 | 53.655 |
| 2751 | 54.655 |
| 2752 | 55.655 |
| 2753 | 56.687 |
| 2754 | 57.719 |
| 2755 | 45.541 |
| 2756 | 46.573 |
| 2757 | 47.605 |
| 2758 | 48.605 |
| 2759 | 49.605 |
| 2760 | 50.605 |
| 2761 | 51.605 |
| 2762 | 52.605 |
| 2763 | 53.605 |
| 2764 | 54.605 |
| 2765 | 55.605 |
| 2766 | 56.605 |
| 2767 | 46.25 |
| 2768 | 47.345 |
| 2769 | 48.345 |
| 2770 | 49.345 |
| 2771 | 50.345 |
| 2772 | 51.345 |
| 2773 | 52.345 |
| 2774 | 53.423 |
| 2775 | 54.501 |
| 2776 | 55.579 |
| 2777 | 56.657 |
| 2778 | 33.025 |
| 2779 | 34.025 |
| 2780 | 35.025 |
| 2781 | 36.025 |
| 2782 | 37.025 |
| 2783 | 38.025 |
| 2784 | 39.072 |
| 2785 | 40.12 |
| 2786 | 27.797 |
| 2787 | 28.845 |
| 2788 | 29.845 |
| 2789 | 30.845 |
| 2790 | 31.845 |
| 2791 | 32.862 |
| 2792 | 28.268 |
| 2793 | 29.285 |
| 2794 | 30.285 |
| 2795 | 31.285 |
| 2796 | 32.285 |
| 2797 | 33.285 |
| 2798 | 34.285 |
| 2799 | 25.95 |
| 2800 | 27.025 |
| 2801 | 28.025 |
| 2802 | 29.025 |
| 2803 | 30.079 |
| 2804 | 31.133 |
| 2805 | 32.187 |
| 2806 | 14.581 |
| 2807 | 15.635 |
| 2808 | 16.647 |
| 2809 | 9.659 |
| 2810 | 10.671 |
| 2811 | 11.683 |
| 2812 | 12.695 |
| 2813 | 5.259 |
| 2814 | 6.273 |
| 2815 | 7.287 |
| 2816 | 8.301 |
| 2817 | 9.315 |
| 2818 | 10.315 |
| 2819 | 11.315 |
| 2820 | 12.315 |
| 2821 | 13.315 |
| 2822 | 14.315 |
| 2823 | 9.115 |
| 2824 | 10.125 |
| 2825 | 11.135 |
| 2826 | 12.145 |
| 2827 | 13.169 |
| 2828 | 14.193 |
| 2829 | 4.217 |
| 2830 | 5.241 |
| 2831 | 6.265 |
| 2832 | 7.265 |
| 2833 | 8.265 |
| 2834 | 2.857 |
| 2835 | 3.87 |
| 2836 | 4.882 |
| 2837 | 5.895 |
| 2838 | 2.128 |
| 2839 | 3.142 |
| 2840 | 4.155 |
| 2841 | 5.155 |
| 2842 | 6.155 |
| 2843 | 7.155 |
| 2844 | 8.155 |
| 2845 | 9.155 |
| 2846 | 10.155 |
| 2847 | 11.155 |
| 2848 | 12.155 |
| 2849 | 13.155 |
| 2850 | 14.155 |
| 2851 | 15.155 |
| 2852 | 16.155 |
| 2853 | 17.155 |
| 2854 | 18.155 |
| 2855 | 19.155 |
| 2856 | 20.155 |
| 2857 | 21.155 |
| 2858 | 22.155 |
| 2859 | 23.155 |
| 2860 | 24.155 |
| 2861 | 25.155 |
| 2862 | 26.155 |
| 2863 | 27.155 |
| 2864 | 28.155 |
| 2865 | 29.155 |
| 2866 | 30.155 |
| 2867 | 31.155 |
| 2868 | 32.155 |
| 2869 | 33.155 |
| 2870 | 34.155 |
| 2871 | 35.155 |
| 2872 | 36.155 |
| 2873 | 37.155 |
| 2874 | 38.155 |
| 2875 | 39.155 |
| 2876 | 40.155 |
| 2877 | 41.155 |
| 2878 | 42.155 |
| 2879 | 43.155 |
| 2880 | 44.155 |
| 2881 | 45.155 |
| 2882 | 46.155 |
| 2883 | 47.155 |
| 2884 | 37.245 |
| 2885 | 38.335 |
| 2886 | 39.335 |
| 2887 | 40.335 |
| 2888 | 41.335 |
| 2889 | 42.335 |
| 2890 | 43.335 |
| 2891 | 44.335 |
| 2892 | 45.335 |
| 2893 | 46.335 |
| 2894 | 47.335 |
| 2895 | 48.335 |
| 2896 | 49.335 |
| 2897 | 50.335 |
| 2898 | 51.335 |
| 2899 | 52.335 |
| 2900 | 53.335 |
| 2901 | 54.335 |
| 2902 | 55.335 |
| 2903 | 56.377 |
| 2904 | 57.419 |
| 2905 | 58.461 |
| 2906 | 59.503 |
| 2907 | 45.035 |
| 2908 | 46.035 |
| 2909 | 47.035 |
| 2910 | 43.402 |
| 2911 | 44.41 |
| 2912 | 45.417 |
| 2913 | 46.437 |
| 2914 | 37.407 |
| 2915 | 38.427 |
| 2916 | 39.447 |
| 2917 | 40.467 |
| 2918 | 23.787 |
| 2919 | 24.837 |
| 2920 | 25.887 |
| 2921 | 26.937 |
| 2922 | 27.987 |
| 2923 | 29.057 |
| 2924 | 30.127 |
| 2925 | 31.197 |
| 2926 | 14.137 |
| 2927 | 15.137 |
| 2928 | 16.137 |
| 2929 | 17.137 |
| 2930 | 18.137 |
| 2931 | 19.137 |
| 2932 | 13.951 |
| 2933 | 14.955 |
| 2934 | 15.959 |
| 2935 | 16.963 |
| 2936 | 17.967 |
| 2937 | 19.007 |
| 2938 | 20.047 |
| 2939 | 12.307 |
| 2940 | 13.307 |
| 2941 | 14.307 |
| 2942 | 15.307 |
| 2943 | 16.307 |
| 2944 | 17.307 |
| 2945 | 18.307 |
| 2946 | 19.307 |
| 2947 | 20.307 |
| 2948 | 21.307 |
| 2949 | 22.307 |
| 2950 | 23.307 |
| 2951 | 24.307 |
| 2952 | 25.307 |
| 2953 | 26.307 |
| 2954 | 27.307 |
| 2955 | 28.307 |
| 2956 | 25.042 |
| 2957 | 26.067 |
| 2958 | 27.067 |
| 2959 | 28.067 |
| 2960 | 29.067 |
| 2961 | 30.067 |
| 2962 | 31.067 |
| 2963 | 32.067 |
| 2964 | 33.067 |
| 2965 | 34.067 |
| 2966 | 35.067 |
| 2967 | 36.067 |
| 2968 | 37.067 |
| 2969 | 38.067 |
| 2970 | 39.067 |
| 2971 | 40.067 |
| 2972 | 41.067 |
| 2973 | 42.067 |
| 2974 | 28.107 |
| 2975 | 29.147 |
| 2976 | 30.187 |
| 2977 | 31.227 |
| 2978 | 32.267 |
| 2979 | 33.321 |
| 2980 | 34.374 |
| 2981 | 24.427 |
| 2982 | 14.491 |
| 2983 | 15.515 |
| 2984 | 16.539 |
| 2985 | 17.563 |
| 2986 | 18.587 |
| 2987 | 19.587 |
| 2988 | 20.587 |
| 2989 | 21.587 |
| 2990 | 22.587 |
| 2991 | 23.587 |
| 2992 | 24.587 |
| 2993 | 25.587 |
| 2994 | 26.587 |
| 2995 | 27.587 |
| 2996 | 28.619 |
| 2997 | 29.651 |
| 2998 | 17.873 |
| 2999 | 18.905 |
| 3000 | 19.937 |
| 3001 | 20.937 |
| 3002 | 21.937 |
| 3003 | 22.937 |
| 3004 | 23.937 |
| 3005 | 24.937 |
| 3006 | 25.937 |
| 3007 | 26.937 |
| 3008 | 27.937 |
| 3009 | 28.937 |
| 3010 | 29.937 |
| 3011 | 30.937 |
| 3012 | 31.937 |
| 3013 | 32.937 |
| 3014 | 33.937 |
| 3015 | 29.751 |
| 3016 | 30.764 |
| 3017 | 31.777 |
| 3018 | 32.777 |
| 3019 | 33.777 |
| 3020 | 34.851 |
| 3021 | 21.924 |
| 3022 | 22.997 |
| 3023 | 23.997 |
| 3024 | 24.997 |
| 3025 | 25.997 |
| 3026 | 26.997 |
| 3027 | 27.997 |
| 3028 | 29.055 |
| 3029 | 30.112 |
| 3030 | 15.7 |
| 3031 | 16.757 |
| 3032 | 17.785 |
| 3033 | 6.613 |
| 3034 | 7.641 |
| 3035 | 8.669 |
| 3036 | 9.697 |
| 3037 | 10.74 |
| 3038 | 11.782 |
| 3039 | 0.325 |
| 3040 | 1.367 |
| 3041 | 2.367 |
| 3042 | 3.367 |
| 3043 | 4.367 |
| 3044 | 5.367 |
| 3045 | 6.367 |
| 3046 | 7.367 |
| 3047 | 8.367 |
| 3048 | 9.367 |
| 3049 | 10.367 |
| 3050 | 11.367 |
| 3051 | 12.367 |
| 3052 | 13.367 |
| 3053 | 8.267 |
| 3054 | 9.277 |
| 3055 | 10.287 |
| 3056 | 11.297 |
| 3057 | 12.297 |
| 3058 | 13.297 |
| 3059 | 14.297 |
| 3060 | 15.297 |
| 3061 | 16.297 |
| 3062 | 17.297 |
| 3063 | 18.297 |
| 3064 | 19.297 |
| 3065 | 20.343 |
| 3066 | 21.389 |
| 3067 | 22.435 |
| 3068 | 6.981 |
| 3069 | 8.027 |
| 3070 | 9.027 |
| 3071 | 10.027 |
| 3072 | 11.027 |
| 3073 | 12.027 |
| 3074 | 13.067 |
| 3075 | 14.107 |
| 3076 | 0 |
| 3077 | 1.04 |
| 3078 | 2.08 |
| 3079 | 3.13 |
| 3080 | 0 |
| 3081 | 1.05 |
| 3082 | 2.1 |
| 3083 | 3.1 |
| 3084 | 4.1 |
| 3085 | 5.1 |
| 3086 | 6.136 |
| 3087 | 7.172 |
| 3088 | 0 |
| 3089 | 1.036 |
| 3090 | 2.072 |
| 3091 | 0 |
| 3092 | 1.052 |
| 3093 | 2.105 |
| 3094 | 3.158 |
| 3095 | 4.158 |
| 3096 | 5.158 |
| 3097 | 6.158 |
| 3098 | 7.158 |
| 3099 | 8.158 |
| 3100 | 9.158 |
| 3101 | 10.158 |
| 3102 | 11.158 |
| 3103 | 12.158 |
| 3104 | 13.158 |
| 3105 | 14.158 |
| 3106 | 15.158 |
| 3107 | 16.157 |
| 3108 | 17.158 |
| 3109 | 18.158 |
| 3110 | 19.198 |
| 3111 | 14.268 |
| 3112 | 15.268 |
| 3113 | 16.267 |
| 3114 | 8.214 |
| 3115 | 9.23 |
| 3116 | 10.246 |
| 3117 | 11.262 |
| 3118 | 12.278 |
| 3119 | 13.278 |
| 3120 | 14.278 |
| 3121 | 15.278 |
| 3122 | 16.278 |
| 3123 | 17.278 |
| 3124 | 18.278 |
| 3125 | 19.278 |
| 3126 | 20.278 |
| 3127 | 21.278 |
| 3128 | 22.278 |
| 3129 | 23.278 |
| 3130 | 15.073 |
| 3131 | 16.098 |
| 3132 | 17.123 |
| 3133 | 18.148 |
| 3134 | 7.704 |
| 3135 | 8.761 |
| 3136 | 9.818 |
| 3137 | 0 |
| 3138 | 1.026 |
| 3139 | 2.052 |
| 3140 | 3.078 |
| 3141 | 4.104 |
| 3142 | 5.104 |
| 3143 | 6.104 |
| 3144 | 7.104 |
| 3145 | 8.104 |
| 3146 | 9.104 |
| 3147 | 10.104 |
| 3148 | 11.104 |
| 3149 | 12.104 |
| 3150 | 13.104 |
| 3151 | 14.104 |
| 3152 | 15.104 |
| 3153 | 16.104 |
| 3154 | 17.104 |
| 3155 | 18.104 |
| 3156 | 19.137 |
| 3157 | 11.941 |
| 3158 | 12.974 |
| 3159 | 13.974 |
| 3160 | 14.974 |
| 3161 | 15.974 |
| 3162 | 16.974 |
| 3163 | 17.974 |
| 3164 | 18.974 |
| 3165 | 19.974 |
| 3166 | 20.974 |
| 3167 | 21.974 |
| 3168 | 22.974 |
| 3169 | 23.974 |
| 3170 | 24.974 |
| 3171 | 25.974 |
| 3172 | 27.009 |
| 3173 | 17.084 |
| 3174 | 18.119 |
| 3175 | 19.154 |
| 3176 | 20.154 |
| 3177 | 21.154 |
| 3178 | 22.154 |
| 3179 | 23.154 |
| 3180 | 24.154 |
| 3181 | 25.154 |
| 3182 | 26.154 |
| 3183 | 27.154 |
| 3184 | 28.172 |
| 3185 | 21.539 |
| 3186 | 22.557 |
| 3187 | 23.574 |
| 3188 | 24.574 |
| 3189 | 25.574 |
| 3190 | 26.574 |
| 3191 | 27.574 |
| 3192 | 28.574 |
| 3193 | 29.574 |
| 3194 | 30.574 |
| 3195 | 31.599 |
| 3196 | 23.624 |
| 3197 | 24.649 |
| 3198 | 25.674 |
| 3199 | 26.674 |
| 3200 | 27.674 |
| 3201 | 28.674 |
| 3202 | 29.674 |
| 3203 | 30.674 |
| 3204 | 31.674 |
| 3205 | 32.674 |
| 3206 | 33.674 |
| 3207 | 34.674 |
| 3208 | 35.708 |
| 3209 | 23.392 |
| 3210 | 24.426 |
| 3211 | 25.46 |
| 3212 | 26.494 |
| 3213 | 27.494 |
| 3214 | 28.494 |
| 3215 | 29.494 |
| 3216 | 30.494 |
| 3217 | 31.494 |
| 3218 | 32.494 |
| 3219 | 33.494 |
| 3220 | 34.494 |
| 3221 | 35.494 |
| 3222 | 36.494 |
| 3223 | 37.494 |
| 3224 | 38.494 |
| 3225 | 39.494 |
| 3226 | 40.494 |
| 3227 | 41.494 |
| 3228 | 42.494 |
| 3229 | 43.494 |
| 3230 | 44.494 |
| 3231 | 45.494 |
| 3232 | 46.494 |
| 3233 | 47.508 |
| 3234 | 39.922 |
| 3235 | 40.936 |
| 3236 | 41.95 |
| 3237 | 42.964 |
| 3238 | 37.7 |
| 3239 | 38.706 |
| 3240 | 39.712 |
| 3241 | 40.718 |
| 3242 | 41.724 |
| 3243 | 39.237 |
| 3244 | 40.241 |
| 3245 | 41.244 |
| 3246 | 42.244 |
| 3247 | 43.244 |
| 3248 | 38.551 |
| 3249 | 39.567 |
| 3250 | 40.584 |
| 3251 | 41.584 |
| 3252 | 42.584 |
| 3253 | 43.584 |
| 3254 | 44.584 |
| 3255 | 45.584 |
| 3256 | 46.584 |
| 3257 | 47.584 |
| 3258 | 48.584 |
| 3259 | 49.584 |
| 3260 | 50.584 |
| 3261 | 51.584 |
| 3262 | 52.584 |
| 3263 | 53.584 |
| 3264 | 54.584 |
| 3265 | 55.584 |
| 3266 | 56.609 |
| 3267 | 57.634 |
| 3268 | 49.549 |
| 3269 | 50.574 |
| 3270 | 51.574 |
| 3271 | 52.574 |
| 3272 | 53.574 |
| 3273 | 54.574 |
| 3274 | 55.574 |
| 3275 | 56.574 |
| 3276 | 57.574 |
| 3277 | 58.574 |
| 3278 | 48.11 |
| 3279 | 49.136 |
| 3280 | 50.162 |
| 3281 | 51.188 |
| 3282 | 52.214 |
| 3283 | 53.214 |
| 3284 | 54.214 |
| 3285 | 55.214 |
| 3286 | 56.214 |
| 3287 | 57.214 |
| 3288 | 58.214 |
| 3289 | 59.214 |
| 3290 | 60.214 |
| 3291 | 61.214 |
| 3292 | 62.214 |
| 3293 | 49.317 |
| 3294 | 50.391 |
| 3295 | 51.464 |
| 3296 | 52.464 |
| 3297 | 53.464 |
| 3298 | 54.464 |
| 3299 | 55.464 |
| 3300 | 56.464 |
| 3301 | 57.464 |
| 3302 | 58.464 |
| 3303 | 59.464 |
| 3304 | 60.464 |
| 3305 | 61.464 |
| 3306 | 62.464 |
| 3307 | 63.464 |
| 3308 | 64.464 |
| 3309 | 65.464 |
| 3310 | 66.464 |
| 3311 | 67.464 |
| 3312 | 68.514 |
| 3313 | 69.564 |
| 3314 | 56.614 |
| 3315 | 57.664 |
| 3316 | 58.664 |
| 3317 | 59.664 |
| 3318 | 60.664 |
| 3319 | 61.664 |
| 3320 | 62.664 |
| 3321 | 63.664 |
| 3322 | 64.664 |
| 3323 | 65.664 |
| 3324 | 66.664 |
| 3325 | 59.774 |
| 3326 | 60.794 |
| 3327 | 61.814 |
| 3328 | 62.834 |
| 3329 | 63.851 |
| 3330 | 57.269 |
| 3331 | 58.286 |
| 3332 | 59.304 |
| 3333 | 60.338 |
| 3334 | 61.372 |
| 3335 | 62.406 |
| 3336 | 49.72 |
| 3337 | 50.754 |
| 3338 | 51.772 |
| 3339 | 43.19 |
| 3340 | 44.208 |
| 3341 | 45.226 |
| 3342 | 46.244 |
| 3343 | 47.244 |
| 3344 | 48.244 |
| 3345 | 49.297 |
| 3346 | 39.351 |
| 3347 | 40.404 |
| 3348 | 41.404 |
| 3349 | 42.404 |
| 3350 | 43.404 |
| 3351 | 44.404 |
| 3352 | 45.404 |
| 3353 | 46.404 |
| 3354 | 47.404 |
| 3355 | 48.404 |
| 3356 | 49.404 |
| 3357 | 50.404 |
| 3358 | 51.404 |
| 3359 | 52.404 |
| 3360 | 53.404 |
| 3361 | 54.404 |
| 3362 | 55.404 |
| 3363 | 56.406 |
| 3364 | 53.409 |
| 3365 | 54.411 |
| 3366 | 55.414 |
| 3367 | 56.414 |
| 3368 | 57.414 |
| 3369 | 58.414 |
| 3370 | 59.414 |
| 3371 | 60.414 |
| 3372 | 61.452 |
| 3373 | 62.49 |
| 3374 | 63.528 |
| 3375 | 50.066 |
| 3376 | 51.104 |
| 3377 | 52.104 |
| 3378 | 53.104 |
| 3379 | 54.104 |
| 3380 | 55.104 |
| 3381 | 56.104 |
| 3382 | 57.164 |
| 3383 | 58.224 |
| 3384 | 59.284 |
| 3385 | 44.344 |
| 3386 | 45.344 |
| 3387 | 46.344 |
| 3388 | 47.344 |
| 3389 | 48.344 |
| 3390 | 49.344 |
| 3391 | 50.344 |
| 3392 | 51.344 |
| 3393 | 52.344 |
| 3394 | 53.344 |
| 3395 | 54.344 |
| 3396 | 55.344 |
| 3397 | 56.344 |
| 3398 | 57.344 |
| 3399 | 53.989 |
| 3400 | 55.014 |
| 3401 | 56.014 |
| 3402 | 57.014 |
| 3403 | 58.014 |
| 3404 | 59.014 |
| 3405 | 60.076 |
| 3406 | 61.139 |
| 3407 | 62.201 |
| 3408 | 46.764 |
| 3409 | 47.764 |
| 3410 | 48.764 |
| 3411 | 49.764 |
| 3412 | 50.764 |
| 3413 | 51.764 |
| 3414 | 52.764 |
| 3415 | 53.764 |
| 3416 | 54.764 |
| 3417 | 55.764 |
| 3418 | 56.764 |
| 3419 | 57.764 |
| 3420 | 58.764 |
| 3421 | 59.764 |
| 3422 | 53.599 |
| 3423 | 54.614 |
| 3424 | 55.629 |
| 3425 | 56.644 |
| 3426 | 57.706 |
| 3427 | 58.769 |
| 3428 | 59.831 |
| 3429 | 44.394 |
| 3430 | 45.394 |
| 3431 | 46.394 |
| 3432 | 47.394 |
| 3433 | 48.394 |
| 3434 | 49.394 |
| 3435 | 50.394 |
| 3436 | 51.394 |
| 3437 | 52.394 |
| 3438 | 53.394 |
| 3439 | 54.394 |
| 3440 | 55.394 |
| 3441 | 56.394 |
| 3442 | 57.394 |
| 3443 | 58.394 |
| 3444 | 59.394 |
| 3445 | 60.394 |
| 3446 | 61.394 |
| 3447 | 62.394 |
| 3448 | 63.394 |
| 3449 | 58.398 |
| 3450 | 59.402 |
| 3451 | 60.406 |
| 3452 | 61.41 |
| 3453 | 62.414 |
| 3454 | 63.414 |
| 3455 | 64.414 |
| 3456 | 65.414 |
| 3457 | 66.414 |
| 3458 | 67.414 |
| 3459 | 68.414 |
| 3460 | 69.414 |
| 3461 | 70.414 |
| 3462 | 71.414 |
| 3463 | 72.414 |
| 3464 | 73.414 |
| 3465 | 74.414 |
| 3466 | 75.414 |
| 3467 | 76.414 |
| 3468 | 77.414 |
| 3469 | 78.414 |
| 3470 | 79.414 |
| 3471 | 80.414 |
| 3472 | 81.414 |
| 3473 | 82.414 |
| 3474 | 83.414 |
| 3475 | 84.414 |
| 3476 | 85.414 |
| 3477 | 86.414 |
| 3478 | 87.414 |
| 3479 | 88.414 |
| 3480 | 89.414 |
| 3481 | 90.414 |
| 3482 | 91.414 |
| 3483 | 92.414 |
| 3484 | 93.414 |
| 3485 | 94.414 |
| 3486 | 95.414 |
| 3487 | 96.414 |
| 3488 | 97.414 |
| 3489 | 98.414 |
| 3490 | 99.414 |
| 3491 | 100.414 |
| 3492 | 101.414 |
| 3493 | 102.414 |
| 3494 | 103.414 |
| 3495 | 104.414 |
| 3496 | 105.414 |
| 3497 | 106.414 |
| 3498 | 107.414 |
| 3499 | 108.414 |
| 3500 | 109.414 |
| 3501 | 110.414 |
| 3502 | 111.414 |
| 3503 | 112.414 |
| 3504 | 113.414 |
| 3505 | 114.414 |
| 3506 | 115.442 |
| 3507 | 116.47 |
| 3508 | 105.498 |
| 3509 | 106.526 |
| 3510 | 107.554 |
| 3511 | 108.554 |
| 3512 | 109.554 |
| 3513 | 110.554 |
| 3514 | 111.554 |
| 3515 | 112.739 |
| 3516 | 93.614 |
| 3517 | 94.614 |
| 3518 | 95.614 |
| 3519 | 96.614 |
| 3520 | 97.614 |
| 3521 | 98.614 |
| 3522 | 94.121 |
| 3523 | 95.129 |
| 3524 | 96.136 |
| 3525 | 97.144 |
| 3526 | 98.144 |
| 3527 | 99.144 |
| 3528 | 100.144 |
| 3529 | 101.144 |
| 3530 | 102.144 |
| 3531 | 103.144 |
| 3532 | 104.144 |
| 3533 | 105.144 |
| 3534 | 106.144 |
| 3535 | 107.144 |
| 3536 | 101.954 |
| 3537 | 102.964 |
| 3538 | 103.974 |
| 3539 | 104.984 |
| 3540 | 101.214 |
| 3541 | 102.244 |
| 3542 | 103.244 |
| 3543 | 104.244 |
| 3544 | 105.244 |
| 3545 | 106.244 |
| 3546 | 107.244 |
| 3547 | 108.244 |
| 3548 | 109.244 |
| 3549 | 110.244 |
| 3550 | 111.244 |
| 3551 | 112.244 |
| 3552 | 113.244 |
| 3553 | 114.244 |
| 3554 | 115.244 |
| 3555 | 116.244 |
| 3556 | 117.244 |
| 3557 | 118.244 |
| 3558 | 112.534 |
| 3559 | 113.584 |
| 3560 | 108.881 |
| 3561 | 109.889 |
| 3562 | 110.896 |
| 3563 | 111.904 |
| 3564 | 112.904 |
| 3565 | 113.904 |
| 3566 | 114.904 |
| 3567 | 115.989 |
| 3568 | 106.574 |
| 3569 | 107.574 |
| 3570 | 108.574 |
| 3571 | 109.574 |
| 3572 | 110.574 |
| 3573 | 111.574 |
| 3574 | 112.574 |
| 3575 | 113.574 |
| 3576 | 114.574 |
| 3577 | 115.574 |
| 3578 | 116.574 |
| 3579 | 117.574 |
| 3580 | 118.574 |
| 3581 | 119.574 |
| 3582 | 120.574 |
| 3583 | 121.574 |
| 3584 | 122.659 |
| 3585 | 123.744 |
| 3586 | 124.829 |
| 3587 | 104.914 |
| 3588 | 105.914 |
| 3589 | 106.914 |
| 3590 | 107.96 |
| 3591 | 109.006 |
| 3592 | 110.052 |
| 3593 | 94.828 |
| 3594 | 95.874 |
| 3595 | 83.444 |
| 3596 | 84.514 |
| 3597 | 85.584 |
| 3598 | 86.584 |
| 3599 | 87.584 |
| 3600 | 88.584 |
| 3601 | 89.584 |
| 3602 | 90.584 |
| 3603 | 86.071 |
| 3604 | 87.079 |
| 3605 | 88.086 |
| 3606 | 89.094 |
| 3607 | 90.164 |
| 3608 | 91.234 |
| 3609 | 92.304 |
| 3610 | 70.694 |
| 3611 | 71.764 |
| 3612 | 72.867 |
| 3613 | 73.971 |
| 3614 | 56.604 |
| 3615 | 49.824 |
| 3616 | 50.844 |
| 3617 | 51.864 |
| 3618 | 52.884 |
| 3619 | 53.957 |
| 3620 | 55.031 |
| 3621 | 42.104 |
| 3622 | 43.104 |
| 3623 | 44.104 |
| 3624 | 45.104 |
| 3625 | 46.104 |
| 3626 | 47.294 |
| 3627 | 27.534 |
| 3628 | 28.534 |
| 3629 | 29.534 |
| 3630 | 30.534 |
| 3631 | 21.019 |
| 3632 | 22.104 |
| 3633 | 23.104 |
| 3634 | 24.104 |
| 3635 | 25.104 |
| 3636 | 26.104 |
| 3637 | 27.224 |
| 3638 | 14.284 |
| 3639 | 9.444 |
| 3640 | 10.464 |
| 3641 | 11.484 |
| 3642 | 12.519 |
| 3643 | 13.554 |
| 3644 | 3.349 |
| 3645 | 4.384 |
| 3646 | 5.384 |
| 3647 | 6.384 |
| 3648 | 7.384 |
| 3649 | 8.384 |
| 3650 | 9.384 |
| 3651 | 10.579 |
| 3652 | 0 |
| 3653 | 1 |
| 3654 | 2 |
| 3655 | 3 |
| 3656 | 4 |
| 3657 | 5 |
| 3658 | 6 |
| 3659 | 7 |
| 3660 | 8 |
| 3661 | 9 |
| 3662 | 10 |
| 3663 | 11 |
| 3664 | 12.055 |
| 3665 | 5.67 |
| 3666 | 6.67 |
| 3667 | 7.67 |
| 3668 | 8.67 |
| 3669 | 9.67 |
| 3670 | 10.67 |
| 3671 | 11.67 |
| 3672 | 12.67 |
| 3673 | 13.67 |
| 3674 | 14.67 |
| 3675 | 15.67 |
| 3676 | 16.67 |
| 3677 | 17.67 |
| 3678 | 18.67 |
| 3679 | 19.67 |
| 3680 | 20.67 |
| 3681 | 21.67 |
| 3682 | 22.67 |
| 3683 | 23.67 |
| 3684 | 24.67 |
| 3685 | 25.67 |
| 3686 | 26.67 |
| 3687 | 27.67 |
| 3688 | 28.67 |
| 3689 | 29.67 |
| 3690 | 30.67 |
| 3691 | 31.67 |
| 3692 | 32.67 |
| 3693 | 33.67 |
| 3694 | 34.67 |
| 3695 | 35.95 |
| 3696 | 7.23 |
| 3697 | 0.87 |
| 3698 | 1.9 |
| 3699 | 2.93 |
| 3700 | 3.93 |
| 3701 | 4.93 |
| 3702 | 5.93 |
| 3703 | 6.93 |
| 3704 | 7.93 |
| 3705 | 8.93 |
| 3706 | 9.93 |
| 3707 | 10.93 |
| 3708 | 11.93 |
| 3709 | 12.93 |
| 3710 | 13.93 |
| 3711 | 14.93 |
| 3712 | 15.93 |
| 3713 | 16.93 |
| 3714 | 18.21 |
| 3715 | 19.49 |
| 3716 | 0 |
| 3717 | 1 |
| 3718 | 2 |
| 3719 | 3 |
| 3720 | 4 |
| 3721 | 5 |
| 3722 | 6 |
| 3723 | 7 |
| 3724 | 8 |
| 3725 | 9 |
| 3726 | 10 |
| 3727 | 11 |
| 3728 | 12 |
| 3729 | 13 |
| 3730 | 14 |
| 3731 | 15 |
| 3732 | 16.006 |
| 3733 | 10.312 |
| 3734 | 11.318 |
| 3735 | 12.324 |
| 3736 | 13.33 |
| 3737 | 14.39 |
| 3738 | 15.45 |
| 3739 | 4.51 |
| 3740 | 5.51 |
| 3741 | 6.51 |
| 3742 | 7.51 |
| 3743 | 8.51 |
| 3744 | 9.51 |
| 3745 | 10.51 |
| 3746 | 11.51 |
| 3747 | 12.51 |
| 3748 | 13.51 |
| 3749 | 14.51 |
| 3750 | 15.51 |
| 3751 | 16.51 |
| 3752 | 17.51 |
| 3753 | 18.51 |
| 3754 | 19.51 |
| 3755 | 20.51 |
| 3756 | 21.51 |
| 3757 | 22.51 |
| 3758 | 23.51 |
| 3759 | 24.51 |
| 3760 | 25.51 |
| 3761 | 26.51 |
| 3762 | 27.51 |
| 3763 | 28.51 |
| 3764 | 29.51 |
| 3765 | 30.51 |
| 3766 | 31.51 |
| 3767 | 32.51 |
| 3768 | 33.51 |
| 3769 | 34.51 |
| 3770 | 35.543 |
| 3771 | 28.517 |
| 3772 | 29.55 |
| 3773 | 30.55 |
| 3774 | 31.55 |
| 3775 | 32.605 |
| 3776 | 26.1 |
| 3777 | 27.152 |
| 3778 | 13.705 |
| 3779 | 14.757 |
| 3780 | 15.81 |
| 3781 | 16.81 |
| 3782 | 17.81 |
| 3783 | 18.81 |
| 3784 | 19.81 |
| 3785 | 20.85 |
| 3786 | 15.89 |
| 3787 | 13.275 |
| 3788 | 14.275 |
| 3789 | 15.275 |
| 3790 | 16.275 |
| 3791 | 17.275 |
| 3792 | 18.275 |
| 3793 | 19.275 |
| 3794 | 20.275 |
| 3795 | 21.298 |
| 3796 | 15.622 |
| 3797 | 16.645 |
| 3798 | 17.645 |
| 3799 | 18.645 |
| 3800 | 19.645 |
| 3801 | 20.645 |
| 3802 | 13.505 |
| 3803 | 14.565 |
| 3804 | 7.995 |
| 3805 | 9.025 |
| 3806 | 10.055 |
| 3807 | 11.055 |
| 3808 | 12.055 |
| 3809 | 13.055 |
| 3810 | 14.055 |
| 3811 | 15.055 |
| 3812 | 16.055 |
| 3813 | 17.055 |
| 3814 | 18.055 |
| 3815 | 19.055 |
| 3816 | 20.055 |
| 3817 | 21.055 |
| 3818 | 22.055 |
| 3819 | 23.055 |
| 3820 | 24.055 |
| 3821 | 25.055 |
| 3822 | 26.055 |
| 3823 | 27.055 |
| 3824 | 28.055 |
| 3825 | 29.055 |
| 3826 | 30.055 |
| 3827 | 31.055 |
| 3828 | 32.055 |
| 3829 | 33.055 |
| 3830 | 34.055 |
| 3831 | 35.055 |
| 3832 | 36.055 |
| 3833 | 37.055 |
| 3834 | 38.055 |
| 3835 | 39.055 |
| 3836 | 40.081 |
| 3837 | 29.607 |
| 3838 | 30.633 |
| 3839 | 31.659 |
| 3840 | 32.685 |
| 3841 | 33.685 |
| 3842 | 34.685 |
| 3843 | 35.685 |
| 3844 | 36.685 |
| 3845 | 37.685 |
| 3846 | 38.685 |
| 3847 | 39.685 |
| 3848 | 40.685 |
| 3849 | 41.685 |
| 3850 | 42.685 |
| 3851 | 43.685 |
| 3852 | 44.685 |
| 3853 | 45.685 |
| 3854 | 46.685 |
| 3855 | 47.685 |
| 3856 | 48.685 |
| 3857 | 49.685 |
| 3858 | 50.685 |
| 3859 | 51.685 |
| 3860 | 52.685 |
| 3861 | 53.685 |
| 3862 | 54.685 |
| 3863 | 55.685 |
| 3864 | 56.735 |
| 3865 | 50.785 |
| 3866 | 51.785 |
| 3867 | 52.785 |
| 3868 | 53.852 |
| 3869 | 54.92 |
| 3870 | 38.387 |
| 3871 | 39.455 |
| 3872 | 40.455 |
| 3873 | 41.455 |
| 3874 | 42.455 |
| 3875 | 43.455 |
| 3876 | 44.455 |
| 3877 | 45.455 |
| 3878 | 46.455 |
| 3879 | 47.455 |
| 3880 | 48.455 |
| 3881 | 49.455 |
| 3882 | 50.455 |
| 3883 | 51.455 |
| 3884 | 52.455 |
| 3885 | 53.455 |
| 3886 | 54.455 |
| 3887 | 55.455 |
| 3888 | 56.455 |
| 3889 | 57.455 |
| 3890 | 58.455 |
| 3891 | 59.475 |
| 3892 | 52.715 |
| 3893 | 53.735 |
| 3894 | 54.755 |
| 3895 | 55.755 |
| 3896 | 56.755 |
| 3897 | 57.755 |
| 3898 | 58.755 |
| 3899 | 59.755 |
| 3900 | 60.755 |
| 3901 | 61.755 |
| 3902 | 62.755 |
| 3903 | 63.755 |
| 3904 | 60.075 |
| 3905 | 61.085 |
| 3906 | 62.095 |
| 3907 | 63.178 |
| 3908 | 48.762 |
| 3909 | 49.845 |
| 3910 | 50.845 |
| 3911 | 51.845 |
| 3912 | 52.845 |
| 3913 | 53.845 |
| 3914 | 54.845 |
| 3915 | 55.845 |
| 3916 | 56.845 |
| 3917 | 57.845 |
| 3918 | 58.845 |
| 3919 | 59.845 |
| 3920 | 60.845 |
| 3921 | 61.845 |
| 3922 | 62.845 |
| 3923 | 63.845 |
| 3924 | 64.845 |
| 3925 | 65.845 |
| 3926 | 66.845 |
| 3927 | 67.845 |
| 3928 | 68.845 |
| 3929 | 69.845 |
| 3930 | 70.845 |
| 3931 | 71.845 |
| 3932 | 72.845 |
| 3933 | 73.845 |
| 3934 | 74.845 |
| 3935 | 75.845 |
| 3936 | 76.845 |
| 3937 | 77.845 |
| 3938 | 78.845 |
| 3939 | 79.845 |
| 3940 | 80.845 |
| 3941 | 81.845 |
| 3942 | 82.845 |
| 3943 | 77.457 |
| 3944 | 78.47 |
| 3945 | 79.482 |
| 3946 | 80.495 |
| 3947 | 81.495 |
| 3948 | 82.495 |
| 3949 | 83.495 |
| 3950 | 84.495 |
| 3951 | 85.495 |
| 3952 | 86.495 |
| 3953 | 87.495 |
| 3954 | 84.85 |
| 3955 | 85.865 |
| 3956 | 86.865 |
| 3957 | 87.865 |
| 3958 | 88.865 |
| 3959 | 89.865 |
| 3960 | 91.065 |
| 3961 | 70.265 |
| 3962 | 71.265 |
| 3963 | 72.265 |
| 3964 | 73.265 |
| 3965 | 74.265 |
| 3966 | 75.265 |
| 3967 | 76.265 |
| 3968 | 77.265 |
| 3969 | 78.265 |
| 3970 | 79.265 |
| 3971 | 80.345 |
| 3972 | 81.425 |
| 3973 | 67.325 |
| 3974 | 68.325 |
| 3975 | 69.325 |
| 3976 | 70.325 |
| 3977 | 71.325 |
| 3978 | 72.325 |
| 3979 | 73.325 |
| 3980 | 74.325 |
| 3981 | 75.325 |
| 3982 | 76.325 |
| 3983 | 77.325 |
| 3984 | 78.325 |
| 3985 | 79.325 |
| 3986 | 80.325 |
| 3987 | 81.325 |
| 3988 | 82.325 |
| 3989 | 83.325 |
| 3990 | 84.325 |
| 3991 | 85.325 |
| 3992 | 86.325 |
| 3993 | 87.325 |
| 3994 | 88.325 |
| 3995 | 89.325 |
| 3996 | 90.325 |
| 3997 | 91.325 |
| 3998 | 92.325 |
| 3999 | 93.325 |
| 4000 | 94.325 |
| 4001 | 95.325 |
| 4002 | 96.325 |
| 4003 | 97.325 |
| 4004 | 98.325 |
| 4005 | 99.325 |
| 4006 | 100.325 |
| 4007 | 101.325 |
| 4008 | 102.402 |
| 4009 | 88.978 |
| 4010 | 90.055 |
| 4011 | 91.055 |
| 4012 | 92.055 |
| 4013 | 93.055 |
| 4014 | 94.055 |
| 4015 | 95.055 |
| 4016 | 96.055 |
| 4017 | 97.055 |
| 4018 | 98.055 |
| 4019 | 99.055 |
| 4020 | 100.055 |
| 4021 | 101.055 |
| 4022 | 102.055 |
| 4023 | 103.055 |
| 4024 | 104.055 |
| 4025 | 105.055 |
| 4026 | 106.055 |
| 4027 | 107.055 |
| 4028 | 108.055 |
| 4029 | 109.055 |
| 4030 | 110.055 |
| 4031 | 111.055 |
| 4032 | 112.055 |
| 4033 | 92.115 |
| 4034 | 93.305 |
| 4035 | 94.305 |
| 4036 | 95.305 |
| 4037 | 96.305 |
| 4038 | 97.305 |
| 4039 | 98.305 |
| 4040 | 99.305 |
| 4041 | 100.305 |
| 4042 | 101.305 |
| 4043 | 102.305 |
| 4044 | 103.305 |
| 4045 | 104.305 |
| 4046 | 105.305 |
| 4047 | 106.305 |
| 4048 | 107.305 |
| 4049 | 108.305 |
| 4050 | 109.305 |
| 4051 | 110.305 |
| 4052 | 111.305 |
| 4053 | 112.305 |
| 4054 | 113.305 |
| 4055 | 114.305 |
| 4056 | 115.305 |
| 4057 | 116.305 |
| 4058 | 117.305 |
| 4059 | 118.305 |
| 4060 | 119.305 |
| 4061 | 120.305 |
| 4062 | 121.305 |
| 4063 | 122.305 |
| 4064 | 123.305 |
| 4065 | 124.305 |
| 4066 | 125.305 |
| 4067 | 126.305 |
| 4068 | 127.305 |
| 4069 | 128.305 |
| 4070 | 129.305 |
| 4071 | 130.305 |
| 4072 | 131.305 |
| 4073 | 132.305 |
| 4074 | 133.305 |
| 4075 | 134.305 |
| 4076 | 135.305 |
| 4077 | 136.305 |
| 4078 | 137.305 |
| 4079 | 138.305 |
| 4080 | 139.305 |
| 4081 | 140.305 |
| 4082 | 141.4 |
| 4083 | 130.805 |
| 4084 | 125.955 |
| 4085 | 126.995 |
| 4086 | 127.995 |
| 4087 | 128.995 |
| 4088 | 129.995 |
| 4089 | 130.995 |
| 4090 | 126.79 |
| 4091 | 127.795 |
| 4092 | 128.8 |
| 4093 | 129.805 |
| 4094 | 130.828 |
| 4095 | 125.362 |
| 4096 | 126.385 |
| 4097 | 127.385 |
| 4098 | 128.385 |
| 4099 | 129.385 |
| 4100 | 130.385 |
| 4101 | 131.385 |
| 4102 | 126.405 |
| 4103 | 127.425 |
| 4104 | 128.445 |
| 4105 | 129.445 |
| 4106 | 130.445 |
| 4107 | 131.445 |
| 4108 | 132.445 |
| 4109 | 133.445 |
| 4110 | 134.445 |
| 4111 | 135.445 |
| 4112 | 136.445 |
| 4113 | 137.445 |
| 4114 | 138.445 |
| 4115 | 139.445 |
| 4116 | 140.445 |
| 4117 | 141.445 |
| 4118 | 142.445 |
| 4119 | 143.445 |
| 4120 | 144.445 |
| 4121 | 145.445 |
| 4122 | 146.445 |
| 4123 | 147.445 |
| 4124 | 148.445 |
| 4125 | 149.445 |
| 4126 | 150.445 |
| 4127 | 151.515 |
| 4128 | 139.085 |
| 4129 | 140.155 |
| 4130 | 141.155 |
| 4131 | 142.155 |
| 4132 | 143.155 |
| 4133 | 144.155 |
| 4134 | 145.155 |
| 4135 | 146.155 |
| 4136 | 147.155 |
| 4137 | 148.155 |
| 4138 | 149.155 |
| 4139 | 150.155 |
| 4140 | 151.155 |
| 4141 | 152.155 |
| 4142 | 153.155 |
| 4143 | 154.155 |
| 4144 | 155.155 |
| 4145 | 156.155 |
| 4146 | 157.155 |
| 4147 | 158.155 |
| 4148 | 159.155 |
| 4149 | 160.155 |
| 4150 | 161.155 |
| 4151 | 162.155 |
| 4152 | 163.155 |
| 4153 | 164.155 |
| 4154 | 165.155 |
| 4155 | 166.155 |
| 4156 | 167.155 |
| 4157 | 168.155 |
| 4158 | 169.155 |
| 4159 | 170.155 |
| 4160 | 171.155 |
| 4161 | 172.155 |
| 4162 | 173.155 |
| 4163 | 174.155 |
| 4164 | 175.155 |
| 4165 | 176.155 |
| 4166 | 177.155 |
| 4167 | 178.155 |
| 4168 | 179.155 |
| 4169 | 180.155 |
| 4170 | 181.155 |
| 4171 | 182.155 |
| 4172 | 183.155 |
| 4173 | 184.155 |
| 4174 | 185.155 |
| 4175 | 186.155 |
| 4176 | 187.155 |
| 4177 | 188.155 |
| 4178 | 189.155 |
| 4179 | 190.252 |
| 4180 | 191.35 |
| 4181 | 169.167 |
| 4182 | 170.265 |
| 4183 | 171.265 |
| 4184 | 172.265 |
| 4185 | 173.265 |
| 4186 | 174.265 |
| 4187 | 175.265 |
| 4188 | 176.265 |
| 4189 | 177.265 |
| 4190 | 178.265 |
| 4191 | 179.265 |
| 4192 | 180.265 |
| 4193 | 181.265 |
| 4194 | 182.265 |
| 4195 | 183.265 |
| 4196 | 184.265 |
| 4197 | 185.265 |
| 4198 | 186.265 |
| 4199 | 187.265 |
| 4200 | 188.265 |
| 4201 | 189.282 |
| 4202 | 182.9 |
| 4203 | 183.917 |
| 4204 | 184.935 |
| 4205 | 185.935 |
| 4206 | 186.935 |
| 4207 | 187.935 |
| 4208 | 188.935 |
| 4209 | 166.035 |
| 4210 | 167.135 |
| 4211 | 168.235 |
| 4212 | 169.335 |
| 4213 | 170.365 |
| 4214 | 161.395 |
| 4215 | 162.425 |
| 4216 | 163.455 |
| 4217 | 159.857 |
| 4218 | 160.86 |
| 4219 | 161.862 |
| 4220 | 162.865 |
| 4221 | 163.865 |
| 4222 | 164.865 |
| 4223 | 165.865 |
| 4224 | 166.865 |
| 4225 | 167.865 |
| 4226 | 168.865 |
| 4227 | 169.865 |
| 4228 | 170.865 |
| 4229 | 171.865 |
| 4230 | 172.865 |
| 4231 | 173.865 |
| 4232 | 174.865 |
| 4233 | 175.865 |
| 4234 | 176.865 |
| 4235 | 177.865 |
| 4236 | 178.917 |
| 4237 | 179.97 |
| 4238 | 181.022 |
| 4239 | 167.435 |
| 4240 | 161.877 |
| 4241 | 162.89 |
| 4242 | 163.902 |
| 4243 | 164.915 |
| 4244 | 165.915 |
| 4245 | 166.915 |
| 4246 | 167.915 |
| 4247 | 168.915 |
| 4248 | 169.915 |
| 4249 | 170.915 |
| 4250 | 171.915 |
| 4251 | 172.915 |
| 4252 | 173.915 |
| 4253 | 174.915 |
| 4254 | 175.915 |
| 4255 | 176.915 |
| 4256 | 177.915 |
| 4257 | 178.915 |
| 4258 | 179.915 |
| 4259 | 171.59 |
| 4260 | 172.665 |
| 4261 | 173.665 |
| 4262 | 174.665 |
| 4263 | 171.245 |
| 4264 | 172.255 |
| 4265 | 173.265 |
| 4266 | 174.265 |
| 4267 | 175.265 |
| 4268 | 176.265 |
| 4269 | 177.265 |
| 4270 | 178.265 |
| 4271 | 179.308 |
| 4272 | 170.872 |
| 4273 | 171.915 |
| 4274 | 172.915 |
| 4275 | 173.915 |
| 4276 | 174.915 |
| 4277 | 175.915 |
| 4278 | 176.915 |
| 4279 | 177.915 |
| 4280 | 178.915 |
| 4281 | 179.915 |
| 4282 | 180.915 |
| 4283 | 181.915 |
| 4284 | 182.915 |
| 4285 | 183.915 |
| 4286 | 184.915 |
| 4287 | 185.915 |
| 4288 | 186.915 |
| 4289 | 187.915 |
| 4290 | 188.915 |
| 4291 | 189.915 |
| 4292 | 190.915 |
| 4293 | 191.915 |
| 4294 | 193 |
| 4295 | 183.585 |
| 4296 | 184.648 |
| 4297 | 185.712 |
| 4298 | 175.245 |
| 4299 | 176.245 |
| 4300 | 177.245 |
| 4301 | 178.245 |
| 4302 | 179.245 |
| 4303 | 180.245 |
| 4304 | 181.245 |
| 4305 | 182.245 |
| 4306 | 183.245 |
| 4307 | 184.245 |
| 4308 | 178.272 |
| 4309 | 179.298 |
| 4310 | 180.325 |
| 4311 | 181.408 |
| 4312 | 182.492 |
| 4313 | 168.035 |
| 4314 | 169.035 |
| 4315 | 170.035 |
| 4316 | 171.035 |
| 4317 | 172.035 |
| 4318 | 173.035 |
| 4319 | 174.035 |
| 4320 | 169.025 |
| 4321 | 170.035 |
| 4322 | 171.045 |
| 4323 | 172.055 |
| 4324 | 173.055 |
| 4325 | 174.055 |
| 4326 | 175.055 |
| 4327 | 176.055 |
| 4328 | 177.055 |
| 4329 | 178.055 |
| 4330 | 179.055 |
| 4331 | 180.105 |
| 4332 | 181.155 |
| 4333 | 168.445 |
| 4334 | 169.495 |
| 4335 | 170.525 |
| 4336 | 161.725 |
| 4337 | 162.755 |
| 4338 | 163.785 |
| 4339 | 164.82 |
| 4340 | 165.855 |
| 4341 | 155.89 |
| 4342 | 156.925 |
| 4343 | 157.925 |
| 4344 | 158.925 |
| 4345 | 159.925 |
| 4346 | 160.925 |
| 4347 | 161.972 |
| 4348 | 149.52 |
| 4349 | 150.567 |
| 4350 | 151.615 |
| 4351 | 137.67 |
| 4352 | 138.725 |
| 4353 | 139.78 |
| 4354 | 140.835 |
| 4355 | 141.835 |
| 4356 | 142.835 |
| 4357 | 143.835 |
| 4358 | 144.835 |
| 4359 | 145.835 |
| 4360 | 146.835 |
| 4361 | 147.835 |
| 4362 | 148.835 |
| 4363 | 149.835 |
| 4364 | 150.835 |
| 4365 | 151.835 |
| 4366 | 152.835 |
| 4367 | 153.835 |
| 4368 | 150.842 |
| 4369 | 151.848 |
| 4370 | 152.855 |
| 4371 | 148.592 |
| 4372 | 149.6 |
| 4373 | 150.607 |
| 4374 | 151.615 |
| 4375 | 152.615 |
| 4376 | 153.615 |
| 4377 | 154.615 |
| 4378 | 155.615 |
| 4379 | 156.615 |
| 4380 | 157.615 |
| 4381 | 141.68 |
| 4382 | 142.745 |
| 4383 | 143.81 |
| 4384 | 144.875 |
| 4385 | 145.875 |
| 4386 | 146.875 |
| 4387 | 147.875 |
| 4388 | 148.875 |
| 4389 | 149.875 |
| 4390 | 150.875 |
| 4391 | 151.875 |
| 4392 | 152.875 |
| 4393 | 153.875 |
| 4394 | 148.945 |
| 4395 | 149.985 |
| 4396 | 151.095 |
| 4397 | 152.205 |
| 4398 | 133.815 |
| 4399 | 134.815 |
| 4400 | 135.815 |
| 4401 | 131.92 |
| 4402 | 132.925 |
| 4403 | 133.93 |
| 4404 | 134.935 |
| 4405 | 135.935 |
| 4406 | 136.935 |
| 4407 | 137.935 |
| 4408 | 138.935 |
| 4409 | 139.935 |
| 4410 | 140.935 |
| 4411 | 141.935 |
| 4412 | 142.935 |
| 4413 | 143.935 |
| 4414 | 144.935 |
| 4415 | 145.935 |
| 4416 | 146.935 |
| 4417 | 147.935 |
| 4418 | 148.935 |
| 4419 | 149.935 |
| 4420 | 150.935 |
| 4421 | 151.935 |
| 4422 | 152.935 |
| 4423 | 153.935 |
| 4424 | 154.935 |
| 4425 | 155.935 |
| 4426 | 156.935 |
| 4427 | 157.935 |
| 4428 | 158.935 |
| 4429 | 159.935 |
| 4430 | 160.935 |
| 4431 | 161.99 |
| 4432 | 163.045 |
| 4433 | 164.1 |
| 4434 | 149.915 |
| 4435 | 141.558 |
| 4436 | 142.602 |
| 4437 | 143.645 |
| 4438 | 144.645 |
| 4439 | 145.645 |
| 4440 | 146.702 |
| 4441 | 136.058 |
| 4442 | 137.115 |
| 4443 | 138.115 |
| 4444 | 139.115 |
| 4445 | 133.165 |
| 4446 | 134.215 |
| 4447 | 126.1 |
| 4448 | 127.125 |
| 4449 | 128.15 |
| 4450 | 129.175 |
| 4451 | 130.175 |
| 4452 | 131.175 |
| 4453 | 132.175 |
| 4454 | 133.175 |
| 4455 | 134.175 |
| 4456 | 135.175 |
| 4457 | 136.175 |
| 4458 | 137.175 |
| 4459 | 138.175 |
| 4460 | 139.175 |
| 4461 | 140.175 |
| 4462 | 141.175 |
| 4463 | 142.175 |
| 4464 | 143.175 |
| 4465 | 144.175 |
| 4466 | 145.175 |
| 4467 | 146.175 |
| 4468 | 147.175 |
| 4469 | 148.175 |
| 4470 | 149.175 |
| 4471 | 150.175 |
| 4472 | 151.175 |
| 4473 | 152.175 |
| 4474 | 153.175 |
| 4475 | 154.175 |
| 4476 | 155.175 |
| 4477 | 156.175 |
| 4478 | 157.175 |
| 4479 | 158.175 |
| 4480 | 159.175 |
| 4481 | 160.175 |
| 4482 | 161.175 |
| 4483 | 154.008 |
| 4484 | 155.042 |
| 4485 | 156.075 |
| 4486 | 153.83 |
| 4487 | 154.845 |
| 4488 | 155.845 |
| 4489 | 156.845 |
| 4490 | 157.845 |
| 4491 | 158.845 |
| 4492 | 159.865 |
| 4493 | 153.085 |
| 4494 | 154.105 |
| 4495 | 155.125 |
| 4496 | 156.125 |
| 4497 | 157.125 |
| 4498 | 158.125 |
| 4499 | 159.125 |
| 4500 | 160.125 |
| 4501 | 161.125 |
| 4502 | 162.125 |
| 4503 | 163.21 |
| 4504 | 164.295 |
| 4505 | 165.38 |
| 4506 | 145.465 |
| 4507 | 146.465 |
| 4508 | 147.465 |
| 4509 | 148.465 |
| 4510 | 149.465 |
| 4511 | 150.465 |
| 4512 | 151.465 |
| 4513 | 152.465 |
| 4514 | 153.465 |
| 4515 | 154.465 |
| 4516 | 155.465 |
| 4517 | 156.465 |
| 4518 | 157.465 |
| 4519 | 158.465 |
| 4520 | 159.465 |
| 4521 | 160.465 |
| 4522 | 161.465 |
| 4523 | 162.465 |
| 4524 | 163.465 |
| 4525 | 164.465 |
| 4526 | 161.242 |
| 4527 | 162.248 |
| 4528 | 163.255 |
| 4529 | 164.392 |
| 4530 | 165.528 |
| 4531 | 143.025 |
| 4532 | 144.025 |
| 4533 | 145.025 |
| 4534 | 146.025 |
| 4535 | 147.025 |
| 4536 | 148.025 |
| 4537 | 149.025 |
| 4538 | 150.025 |
| 4539 | 151.025 |
| 4540 | 152.025 |
| 4541 | 153.025 |
| 4542 | 154.025 |
| 4543 | 155.025 |
| 4544 | 156.025 |
| 4545 | 157.025 |
| 4546 | 158.025 |
| 4547 | 159.025 |
| 4548 | 160.025 |
| 4549 | 161.025 |
| 4550 | 162.025 |
| 4551 | 163.025 |
| 4552 | 164.047 |
| 4553 | 156.44 |
| 4554 | 157.462 |
| 4555 | 158.485 |
| 4556 | 155.632 |
| 4557 | 156.638 |
| 4558 | 157.645 |
| 4559 | 151.025 |
| 4560 | 152.055 |
| 4561 | 153.085 |
| 4562 | 154.085 |
| 4563 | 155.085 |
| 4564 | 156.085 |
| 4565 | 157.085 |
| 4566 | 158.085 |
| 4567 | 159.085 |
| 4568 | 160.085 |
| 4569 | 154.587 |
| 4570 | 155.6 |
| 4571 | 156.612 |
| 4572 | 157.625 |
| 4573 | 158.625 |
| 4574 | 159.625 |
| 4575 | 160.625 |
| 4576 | 161.625 |
| 4577 | 162.625 |
| 4578 | 163.625 |
| 4579 | 164.625 |
| 4580 | 165.625 |
| 4581 | 166.625 |
| 4582 | 167.642 |
| 4583 | 161.29 |
| 4584 | 162.307 |
| 4585 | 163.325 |
| 4586 | 164.325 |
| 4587 | 165.325 |
| 4588 | 166.325 |
| 4589 | 167.325 |
| 4590 | 168.325 |
| 4591 | 169.325 |
| 4592 | 170.325 |
| 4593 | 171.325 |
| 4594 | 172.325 |
| 4595 | 173.325 |
| 4596 | 174.325 |
| 4597 | 175.325 |
| 4598 | 176.325 |
| 4599 | 177.325 |
| 4600 | 178.325 |
| 4601 | 179.325 |
| 4602 | 180.325 |
| 4603 | 173.515 |
| 4604 | 174.535 |
| 4605 | 175.555 |
| 4606 | 176.575 |
| 4607 | 168.318 |
| 4608 | 169.362 |
| 4609 | 170.405 |
| 4610 | 171.405 |
| 4611 | 172.405 |
| 4612 | 173.405 |
| 4613 | 174.405 |
| 4614 | 175.405 |
| 4615 | 176.405 |
| 4616 | 177.405 |
| 4617 | 178.405 |
| 4618 | 179.405 |
| 4619 | 180.405 |
| 4620 | 181.405 |
| 4621 | 182.405 |
| 4622 | 183.405 |
| 4623 | 184.405 |
| 4624 | 185.405 |
| 4625 | 186.405 |
| 4626 | 183.81 |
| 4627 | 184.825 |
| 4628 | 185.825 |
| 4629 | 186.825 |
| 4630 | 183.865 |
| 4631 | 184.865 |
| 4632 | 185.865 |
| 4633 | 186.865 |
| 4634 | 187.865 |
| 4635 | 183.695 |
| 4636 | 184.695 |
| 4637 | 185.695 |
| 4638 | 186.695 |
| 4639 | 187.695 |
| 4640 | 183.415 |
| 4641 | 184.415 |
| 4642 | 181.865 |
| 4643 | 182.865 |
| 4644 | 180.005 |
| 4645 | 177.175 |
| 4646 | 178.195 |
| 4647 | 179.195 |
| 4648 | 176.405 |
| 4649 | 173.565 |
| 4650 | 170.775 |
| 4651 | 167.945 |
| 4652 | 168.965 |
| 4653 | 169.965 |
| 4654 | 170.965 |
| 4655 | 171.965 |
| 4656 | 172.965 |
| 4657 | 173.965 |
| 4658 | 174.965 |
| 4659 | 175.965 |
| 4660 | 176.965 |
| 4661 | 177.965 |
| 4662 | 178.965 |
| 4663 | 179.965 |
| 4664 | 176.72 |
| 4665 | 177.745 |
| 4666 | 178.745 |
| 4667 | 179.745 |
| 4668 | 180.745 |
| 4669 | 181.745 |
| 4670 | 182.745 |
| 4671 | 183.745 |
| 4672 | 179.765 |
| 4673 | 180.765 |
| 4674 | 181.765 |
| 4675 | 182.765 |
| 4676 | 183.765 |
| 4677 | 184.765 |
| 4678 | 185.765 |
| 4679 | 186.765 |
| 4680 | 187.765 |
| 4681 | 188.765 |
| 4682 | 189.765 |
| 4683 | 190.765 |
| 4684 | 187.535 |
| 4685 | 188.555 |
| 4686 | 185.425 |
| 4687 | 186.425 |
| 4688 | 187.425 |
| 4689 | 183.835 |
| 4690 | 184.835 |
| 4691 | 185.835 |
| 4692 | 186.835 |
| 4693 | 187.835 |
| 4694 | 188.835 |
| 4695 | 189.835 |
| 4696 | 190.835 |
| 4697 | 191.835 |
| 4698 | 192.835 |
| 4699 | 193.835 |
| 4700 | 194.835 |
| 4701 | 195.835 |
| 4702 | 196.835 |
| 4703 | 197.835 |
| 4704 | 198.835 |
| 4705 | 196.12 |
| 4706 | 197.135 |
| 4707 | 198.135 |
| 4708 | 193.935 |
| 4709 | 190.015 |
| 4710 | 191.015 |
| 4711 | 187.935 |
| 4712 | 188.955 |
| 4713 | 189.98 |
| 4714 | 186.315 |
| 4715 | 187.315 |
| 4716 | 184.435 |
| 4717 | 185.455 |
| 4718 | 186.455 |
| 4719 | 187.475 |
| 4720 | 184.395 |
| 4721 | 185.395 |
| 4722 | 186.395 |
| 4723 | 187.395 |
| 4724 | 188.395 |
| 4725 | 189.395 |
| 4726 | 190.395 |
| 4727 | 191.395 |
| 4728 | 192.395 |
| 4729 | 189.215 |
| 4730 | 190.215 |
| 4731 | 191.215 |
| 4732 | 192.215 |
| 4733 | 193.215 |
| 4734 | 194.215 |
| 4735 | 195.215 |
| 4736 | 196.215 |
| 4737 | 197.215 |
| 4738 | 198.215 |
| 4739 | 199.215 |
| 4740 | 193.575 |
| 4741 | 194.575 |
| 4742 | 195.575 |
| 4743 | 196.575 |
| 4744 | 193.285 |
| 4745 | 194.285 |
| 4746 | 195.285 |
| 4747 | 193.075 |
| 4748 | 194.075 |
| 4749 | 191.775 |
| 4750 | 192.775 |
| 4751 | 188.615 |
| 4752 | 189.615 |
| 4753 | 190.615 |
| 4754 | 191.615 |
| 4755 | 188.575 |
| 4756 | 189.575 |
| 4757 | 190.575 |
| 4758 | 191.575 |
| 4759 | 192.575 |
| 4760 | 193.575 |
| 4761 | 194.575 |
| 4762 | 195.575 |
| 4763 | 193.18 |
| 4764 | 194.195 |
| 4765 | 195.195 |
| 4766 | 196.195 |
| 4767 | 197.195 |
| 4768 | 198.195 |
| 4769 | 199.195 |
| 4770 | 200.195 |
| 4771 | 201.195 |
| 4772 | 202.195 |
| 4773 | 203.21 |
| 4774 | 200.765 |
| 4775 | 201.765 |
| 4776 | 202.765 |
| 4777 | 203.765 |
| 4778 | 204.765 |
| 4779 | 205.765 |
| 4780 | 206.765 |
| 4781 | 207.765 |
| 4782 | 208.765 |
| 4783 | 209.765 |
| 4784 | 210.765 |
| 4785 | 211.765 |
| 4786 | 212.765 |
| 4787 | 213.765 |
| 4788 | 214.765 |
| 4789 | 215.765 |
| 4790 | 212.31 |
| 4791 | 213.335 |
| 4792 | 214.35 |
| 4793 | 211.755 |
| 4794 | 207.355 |
| 4795 | 208.355 |
| 4796 | 205.595 |
| 4797 | 206.595 |
| 4798 | 207.595 |
| 4799 | 208.595 |
| 4800 | 209.595 |
| 4801 | 210.595 |
| 4802 | 206.745 |
| 4803 | 207.745 |
| 4804 | 208.745 |
| 4805 | 206.42 |
| 4806 | 207.435 |
| 4807 | 208.435 |
| 4808 | 209.435 |
| 4809 | 210.435 |
| 4810 | 211.435 |
| 4811 | 212.435 |
| 4812 | 213.435 |
| 4813 | 206.965 |
| 4814 | 207.965 |
| 4815 | 208.965 |
| 4816 | 209.965 |
| 4817 | 210.965 |
| 4818 | 208.125 |
| 4819 | 209.125 |
| 4820 | 210.125 |
| 4821 | 207.145 |
| 4822 | 208.165 |
| 4823 | 204.535 |
| 4824 | 205.535 |
| 4825 | 202.285 |
| 4826 | 203.285 |
| 4827 | 204.285 |
| 4828 | 205.285 |
| 4829 | 206.285 |
| 4830 | 207.285 |
| 4831 | 203.515 |
| 4832 | 204.515 |
| 4833 | 200.15 |
| 4834 | 201.185 |
| 4835 | 197.315 |
| 4836 | 192.225 |
| 4837 | 193.225 |
| 4838 | 194.225 |
| 4839 | 188.895 |
| 4840 | 185.915 |
| 4841 | 186.915 |
| 4842 | 184.275 |
| 4843 | 185.275 |
| 4844 | 186.275 |
| 4845 | 187.275 |
| 4846 | 188.275 |
| 4847 | 184.06 |
| 4848 | 185.095 |
| 4849 | 182.425 |
| 4850 | 183.425 |
| 4851 | 184.445 |
| 4852 | 181.285 |
| 4853 | 178.085 |
| 4854 | 179.105 |
| 4855 | 180.105 |
| 4856 | 181.105 |
| 4857 | 178.41 |
| 4858 | 179.425 |
| 4859 | 180.425 |
| 4860 | 181.425 |
| 4861 | 182.425 |
| 4862 | 183.425 |
| 4863 | 184.425 |
| 4864 | 185.425 |
| 4865 | 186.425 |
| 4866 | 187.425 |
| 4867 | 188.425 |
| 4868 | 189.425 |
| 4869 | 190.425 |
| 4870 | 191.425 |
| 4871 | 192.425 |
| 4872 | 193.425 |
| 4873 | 194.425 |
| 4874 | 195.425 |
| 4875 | 196.425 |
| 4876 | 197.425 |
| 4877 | 198.425 |
| 4878 | 199.425 |
| 4879 | 200.425 |
| 4880 | 201.425 |
| 4881 | 198.555 |
| 4882 | 199.555 |
| 4883 | 200.555 |
| 4884 | 201.555 |
| 4885 | 202.555 |
| 4886 | 203.585 |
| 4887 | 199.825 |
| 4888 | 196.685 |
| 4889 | 197.685 |
| 4890 | 198.685 |
| 4891 | 199.685 |
| 4892 | 200.685 |
| 4893 | 201.685 |
| 4894 | 202.685 |
| 4895 | 203.685 |
| 4896 | 204.685 |
| 4897 | 205.71 |
| 4898 | 202.225 |
| 4899 | 203.225 |
| 4900 | 204.225 |
| 4901 | 205.225 |
| 4902 | 206.225 |
| 4903 | 207.225 |
| 4904 | 208.24 |
| 4905 | 205.705 |
| 4906 | 206.705 |
| 4907 | 207.725 |
| 4908 | 204.815 |
| 4909 | 205.84 |
| 4910 | 202.435 |
| 4911 | 203.435 |
| 4912 | 200.695 |
| 4913 | 201.695 |
| 4914 | 202.695 |
| 4915 | 200.235 |
| 4916 | 201.235 |
| 4917 | 202.235 |
| 4918 | 203.235 |
| 4919 | 204.235 |
| 4920 | 205.235 |
| 4921 | 206.235 |
| 4922 | 207.235 |
| 4923 | 208.235 |
| 4924 | 209.235 |
| 4925 | 205.915 |
| 4926 | 206.915 |
| 4927 | 207.915 |
| 4928 | 208.94 |
| 4929 | 205.705 |
| 4930 | 206.705 |
| 4931 | 207.705 |
| 4932 | 208.705 |
| 4933 | 209.705 |
| 4934 | 210.705 |
| 4935 | 211.705 |
| 4936 | 212.705 |
| 4937 | 213.705 |
| 4938 | 214.705 |
| 4939 | 215.705 |
| 4940 | 216.705 |
| 4941 | 212.715 |
| 4942 | 213.715 |
| 4943 | 214.715 |
| 4944 | 212.275 |
| 4945 | 213.275 |
| 4946 | 214.275 |
| 4947 | 215.275 |
| 4948 | 212.76 |
| 4949 | 213.775 |
| 4950 | 214.775 |
| 4951 | 215.775 |
| 4952 | 212.835 |
| 4953 | 213.835 |
| 4954 | 214.835 |
| 4955 | 215.835 |
| 4956 | 212.195 |
| 4957 | 213.195 |
| 4958 | 214.235 |
| 4959 | 209.315 |
| 4960 | 206.435 |
| 4961 | 202.85 |
| 4962 | 203.875 |
| 4963 | 200.695 |
| 4964 | 201.695 |
| 4965 | 202.695 |
| 4966 | 203.695 |
| 4967 | 204.695 |
| 4968 | 205.695 |
| 4969 | 206.695 |
| 4970 | 207.695 |
| 4971 | 208.695 |
| 4972 | 209.695 |
| 4973 | 210.695 |
| 4974 | 211.695 |
| 4975 | 212.695 |
| 4976 | 213.695 |
| 4977 | 209.985 |
| 4978 | 207.585 |
| 4979 | 208.585 |
| 4980 | 209.585 |
| 4981 | 210.605 |
| 4982 | 207.665 |
| 4983 | 208.685 |
| 4984 | 205.805 |
| 4985 | 206.805 |
| 4986 | 207.805 |
| 4987 | 208.805 |
| 4988 | 209.805 |
| 4989 | 210.805 |
| 4990 | 211.805 |
| 4991 | 212.805 |
| 4992 | 213.805 |
| 4993 | 214.805 |
| 4994 | 215.805 |
| 4995 | 216.805 |
| 4996 | 217.805 |
| 4997 | 218.805 |
| 4998 | 219.805 |
| 4999 | 220.805 |
| 5000 | 221.805 |
| 5001 | 222.805 |
| 5002 | 223.805 |
| 5003 | 224.805 |
| 5004 | 225.805 |
| 5005 | 226.805 |
| 5006 | 224.215 |
| 5007 | 225.215 |
| 5008 | 226.215 |
| 5009 | 227.215 |
| 5010 | 228.215 |
| 5011 | 224.195 |
| 5012 | 225.195 |
| 5013 | 226.195 |
| 5014 | 227.195 |
| 5015 | 228.195 |
| 5016 | 229.195 |
| 5017 | 230.195 |
| 5018 | 231.195 |
| 5019 | 232.195 |
| 5020 | 233.195 |
| 5021 | 230.135 |
| 5022 | 226.015 |
| 5023 | 227.015 |
| 5024 | 228.015 |
| 5025 | 224.985 |
| 5026 | 221.365 |
| 5027 | 222.365 |
| 5028 | 223.365 |
| 5029 | 224.365 |
| 5030 | 225.365 |
| 5031 | 226.365 |
| 5032 | 227.365 |
| 5033 | 223.555 |
| 5034 | 224.555 |
| 5035 | 225.555 |
| 5036 | 222.665 |
| 5037 | 223.665 |
| 5038 | 224.665 |
| 5039 | 225.665 |
| 5040 | 226.665 |
| 5041 | 227.665 |
| 5042 | 228.665 |
| 5043 | 229.665 |
| 5044 | 230.665 |
| 5045 | 231.665 |
| 5046 | 228.955 |
| 5047 | 229.955 |
| 5048 | 225.745 |
| 5049 | 223.455 |
| 5050 | 224.455 |
| 5051 | 221.285 |
| 5052 | 222.285 |
| 5053 | 223.285 |
| 5054 | 224.285 |
| 5055 | 220.905 |
| 5056 | 221.905 |
| 5057 | 222.905 |
| 5058 | 219.865 |
| 5059 | 220.865 |
| 5060 | 221.865 |
| 5061 | 217.495 |
| 5062 | 218.495 |
| 5063 | 219.495 |
| 5064 | 220.495 |
| 5065 | 221.495 |
| 5066 | 222.495 |
| 5067 | 218.055 |
| 5068 | 219.055 |
| 5069 | 220.055 |
| 5070 | 221.055 |
| 5071 | 217.915 |
| 5072 | 218.915 |
| 5073 | 219.915 |
| 5074 | 216.865 |
| 5075 | 217.865 |
| 5076 | 213.745 |
| 5077 | 214.745 |
| 5078 | 215.745 |
| 5079 | 216.745 |
| 5080 | 214.435 |
| 5081 | 215.435 |
| 5082 | 216.435 |
| 5083 | 212.645 |
| 5084 | 213.645 |
| 5085 | 210.925 |
| 5086 | 211.925 |
| 5087 | 212.925 |
| 5088 | 213.925 |
| 5089 | 214.925 |
| 5090 | 211.735 |
| 5091 | 212.735 |
| 5092 | 213.735 |
| 5093 | 214.735 |
| 5094 | 215.735 |
| 5095 | 216.735 |
| 5096 | 217.735 |
| 5097 | 218.735 |
| 5098 | 219.735 |
| 5099 | 220.735 |
| 5100 | 221.735 |
| 5101 | 222.735 |
| 5102 | 223.735 |
| 5103 | 220.795 |
| 5104 | 221.795 |
| 5105 | 222.795 |
| 5106 | 223.795 |
| 5107 | 219.345 |
| 5108 | 220.345 |
| 5109 | 221.345 |
| 5110 | 222.345 |
| 5111 | 223.345 |
| 5112 | 224.345 |
| 5113 | 225.345 |
| 5114 | 226.345 |
| 5115 | 227.345 |
| 5116 | 228.345 |
| 5117 | 229.345 |
| 5118 | 230.345 |
| 5119 | 231.345 |
| 5120 | 232.345 |
| 5121 | 233.345 |
| 5122 | 234.345 |
| 5123 | 235.345 |
| 5124 | 231.955 |
| 5125 | 232.955 |
| 5126 | 233.955 |
| 5127 | 234.955 |
| 5128 | 235.955 |
| 5129 | 232.485 |
| 5130 | 229.155 |
| 5131 | 230.155 |
| 5132 | 231.155 |
| 5133 | 232.155 |
| 5134 | 233.155 |
| 5135 | 234.155 |
| 5136 | 230.995 |
| 5137 | 231.995 |
| 5138 | 232.995 |
| 5139 | 233.995 |
| 5140 | 234.995 |
| 5141 | 230.955 |
| 5142 | 231.955 |
| 5143 | 232.955 |
| 5144 | 233.955 |
| 5145 | 231.055 |
| 5146 | 232.055 |
| 5147 | 233.055 |
| 5148 | 234.055 |
| 5149 | 229.005 |
| 5150 | 230.005 |
| 5151 | 231.005 |
| 5152 | 232.005 |
| 5153 | 233.005 |
| 5154 | 234.005 |
| 5155 | 229.985 |
| 5156 | 230.985 |
| 5157 | 228.665 |
| 5158 | 229.665 |
| 5159 | 230.665 |
| 5160 | 231.665 |
| 5161 | 232.665 |
| 5162 | 233.665 |
| 5163 | 234.665 |
| 5164 | 235.665 |
| 5165 | 236.665 |
| 5166 | 233.435 |
| 5167 | 234.435 |
| 5168 | 231.495 |
| 5169 | 232.495 |
| 5170 | 233.495 |
| 5171 | 230.755 |
| 5172 | 231.755 |
| 5173 | 229.055 |
| 5174 | 230.055 |
| 5175 | 231.055 |
| 5176 | 232.055 |
| 5177 | 233.055 |
| 5178 | 234.055 |
| 5179 | 235.055 |
| 5180 | 236.055 |
| 5181 | 237.055 |
| 5182 | 238.055 |
| 5183 | 239.055 |
| 5184 | 235.525 |
| 5185 | 236.525 |
| 5186 | 232.705 |
| 5187 | 233.705 |
| 5188 | 234.705 |
| 5189 | 235.705 |
| 5190 | 236.705 |
| 5191 | 237.705 |
| 5192 | 238.705 |
| 5193 | 239.705 |
| 5194 | 240.705 |
| 5195 | 237.475 |
| 5196 | 238.475 |
| 5197 | 239.475 |
| 5198 | 235.555 |
| 5199 | 232.665 |
| 5200 | 233.665 |
| 5201 | 234.665 |
| 5202 | 235.665 |
| 5203 | 236.665 |
| 5204 | 234.065 |
| 5205 | 235.065 |
| 5206 | 236.065 |
| 5207 | 237.065 |
| 5208 | 238.065 |
| 5209 | 239.065 |
| 5210 | 236.435 |
| 5211 | 233.295 |
| 5212 | 234.295 |
| 5213 | 235.295 |
| 5214 | 236.295 |
| 5215 | 237.295 |
| 5216 | 238.295 |
| 5217 | 239.295 |
| 5218 | 240.295 |
| 5219 | 241.295 |
| 5220 | 242.295 |
| 5221 | 243.295 |
| 5222 | 244.295 |
| 5223 | 240.775 |
| 5224 | 241.775 |
| 5225 | 242.775 |
| 5226 | 243.775 |
| 5227 | 244.775 |
| 5228 | 245.775 |
| 5229 | 246.775 |
| 5230 | 247.775 |
| 5231 | 248.775 |
| 5232 | 249.775 |
| 5233 | 246.915 |
| 5234 | 247.915 |
| 5235 | 248.915 |
| 5236 | 249.915 |
| 5237 | 247.365 |
| 5238 | 248.365 |
| 5239 | 249.365 |
| 5240 | 250.365 |
| 5241 | 251.365 |
| 5242 | 252.365 |
| 5243 | 253.365 |
| 5244 | 254.365 |
| 5245 | 255.365 |
| 5246 | 256.365 |
| 5247 | 257.365 |
| 5248 | 258.365 |
| 5249 | 259.365 |
| 5250 | 253.485 |
| 5251 | 254.485 |
| 5252 | 255.485 |
| 5253 | 256.485 |
| 5254 | 257.485 |
| 5255 | 258.485 |
| 5256 | 254.685 |
| 5257 | 255.685 |
| 5258 | 256.685 |
| 5259 | 257.685 |
| 5260 | 254.505 |
| 5261 | 255.505 |
| 5262 | 256.505 |
| 5263 | 257.505 |
| 5264 | 258.505 |
| 5265 | 259.505 |
| 5266 | 260.505 |
| 5267 | 261.505 |
| 5268 | 262.505 |
| 5269 | 263.505 |
| 5270 | 264.505 |
| 5271 | 265.505 |
| 5272 | 261.975 |
| 5273 | 262.975 |
| 5274 | 263.975 |
| 5275 | 264.975 |
| 5276 | 265.975 |
| 5277 | 266.975 |
| 5278 | 267.975 |
| 5279 | 268.975 |
| 5280 | 269.975 |
| 5281 | 270.975 |
| 5282 | 271.975 |
| 5283 | 272.975 |
| 5284 | 268.965 |
| 5285 | 269.965 |
| 5286 | 270.965 |
| 5287 | 271.965 |
| 5288 | 272.965 |
| 5289 | 270.435 |
| 5290 | 266.515 |
| 5291 | 267.515 |
| 5292 | 268.515 |
| 5293 | 269.515 |
| 5294 | 266.315 |
| 5295 | 267.315 |
| 5296 | 268.315 |
| 5297 | 269.315 |
| 5298 | 270.315 |
| 5299 | 271.315 |
| 5300 | 272.315 |
| 5301 | 273.315 |
| 5302 | 270.195 |
| 5303 | 266.475 |
| 5304 | 267.475 |
| 5305 | 268.475 |
| 5306 | 264.755 |
| 5307 | 265.755 |
| 5308 | 266.755 |
| 5309 | 267.755 |
| 5310 | 268.755 |
| 5311 | 265.815 |
| 5312 | 263.095 |
| 5313 | 264.095 |
| 5314 | 265.095 |
| 5315 | 266.095 |
| 5316 | 267.095 |
| 5317 | 268.095 |
| 5318 | 269.095 |
| 5319 | 270.095 |
| 5320 | 271.095 |
| 5321 | 272.095 |
| 5322 | 269.305 |
| 5323 | 270.305 |
| 5324 | 271.305 |
| 5325 | 268.655 |
| 5326 | 269.655 |
| 5327 | 270.655 |
| 5328 | 271.655 |
| 5329 | 272.655 |
| 5330 | 273.655 |
| 5331 | 274.655 |
| 5332 | 275.655 |
| 5333 | 272.365 |
| 5334 | 269.425 |
| 5335 | 270.425 |
| 5336 | 271.425 |
| 5337 | 272.425 |
| 5338 | 273.425 |
| 5339 | 274.425 |
| 5340 | 271.905 |
| 5341 | 272.905 |
| 5342 | 273.905 |
| 5343 | 274.905 |
| 5344 | 275.905 |
| 5345 | 276.905 |
| 5346 | 277.905 |
| 5347 | 273.985 |
| 5348 | 274.985 |
| 5349 | 275.985 |
| 5350 | 273.335 |
| 5351 | 269.395 |
| 5352 | 266.945 |
| 5353 | 267.945 |
| 5354 | 268.945 |
| 5355 | 269.945 |
| 5356 | 270.945 |
| 5357 | 271.945 |
| 5358 | 272.945 |
| 5359 | 273.945 |
| 5360 | 274.945 |
| 5361 | 275.945 |
| 5362 | 276.945 |
| 5363 | 277.945 |
| 5364 | 278.945 |
| 5365 | 276.295 |
| 5366 | 277.295 |
| 5367 | 278.295 |
| 5368 | 279.295 |
| 5369 | 275.135 |
| 5370 | 276.135 |
| 5371 | 272.905 |
| 5372 | 273.905 |
| 5373 | 274.905 |
| 5374 | 275.905 |
| 5375 | 276.905 |
| 5376 | 277.905 |
| 5377 | 278.905 |
| 5378 | 276.525 |
| 5379 | 277.525 |
| 5380 | 278.525 |
| 5381 | 279.525 |
| 5382 | 280.525 |
| 5383 | 281.525 |
| 5384 | 277.315 |
| 5385 | 274.265 |
| 5386 | 275.265 |
| 5387 | 276.265 |
| 5388 | 273.725 |
| 5389 | 274.725 |
| 5390 | 275.725 |
| 5391 | 272.965 |
| 5392 | 273.965 |
| 5393 | 274.965 |
| 5394 | 275.965 |
| 5395 | 276.965 |
| 5396 | 277.965 |
| 5397 | 278.965 |
| 5398 | 279.965 |
| 5399 | 280.965 |
| 5400 | 281.965 |
| 5401 | 282.965 |
| 5402 | 280.045 |
| 5403 | 281.045 |
| 5404 | 282.045 |
| 5405 | 279.895 |
| 5406 | 280.895 |
| 5407 | 281.895 |
| 5408 | 279.225 |
| 5409 | 280.225 |
| 5410 | 281.225 |
| 5411 | 282.225 |
| 5412 | 283.225 |
| 5413 | 284.225 |
| 5414 | 285.225 |
| 5415 | 286.225 |
| 5416 | 287.225 |
| 5417 | 288.225 |
| 5418 | 289.225 |
| 5419 | 290.225 |
| 5420 | 287.085 |
| 5421 | 288.085 |
| 5422 | 284.065 |
| 5423 | 285.065 |
| 5424 | 286.065 |
| 5425 | 287.065 |
| 5426 | 282.485 |
| 5427 | 283.485 |
| 5428 | 284.485 |
| 5429 | 281.445 |
| 5430 | 282.445 |
| 5431 | 283.445 |
| 5432 | 284.445 |
| 5433 | 281.755 |
| 5434 | 278.995 |
| 5435 | 279.995 |
| 5436 | 277.155 |
| 5437 | 278.155 |
| 5438 | 274.625 |
| 5439 | 272.075 |
| 5440 | 273.075 |
| 5441 | 274.075 |
| 5442 | 271.695 |
| 5443 | 268.945 |
| 5444 | 269.945 |
| 5445 | 270.945 |
| 5446 | 271.945 |
| 5447 | 272.945 |
| 5448 | 270.085 |
| 5449 | 266.675 |
| 5450 | 267.675 |
| 5451 | 268.675 |
| 5452 | 269.675 |
| 5453 | 270.675 |
| 5454 | 271.675 |
| 5455 | 272.675 |
| 5456 | 273.675 |
| 5457 | 270.355 |
| 5458 | 271.355 |
| 5459 | 272.355 |
| 5460 | 273.355 |
| 5461 | 269.925 |
| 5462 | 270.925 |
| 5463 | 271.925 |
| 5464 | 272.925 |
| 5465 | 269.945 |
| 5466 | 270.945 |
| 5467 | 271.945 |
| 5468 | 272.945 |
| 5469 | 273.945 |
| 5470 | 274.945 |
| 5471 | 275.945 |
| 5472 | 276.945 |
| 5473 | 273.275 |
| 5474 | 274.275 |
| 5475 | 275.275 |
| 5476 | 272.235 |
| 5477 | 273.235 |
| 5478 | 274.235 |
| 5479 | 275.235 |
| 5480 | 276.235 |
| 5481 | 277.235 |
| 5482 | 278.235 |
| 5483 | 279.235 |
| 5484 | 280.235 |
| 5485 | 281.235 |
| 5486 | 277.585 |
| 5487 | 278.585 |
| 5488 | 279.585 |
| 5489 | 280.585 |
| 5490 | 277.615 |
| 5491 | 278.615 |
| 5492 | 275.485 |
| 5493 | 276.485 |
| 5494 | 277.485 |
| 5495 | 275.005 |
| 5496 | 276.005 |
| 5497 | 277.005 |
| 5498 | 278.005 |
| 5499 | 279.005 |
| 5500 | 280.005 |
| 5501 | 281.005 |
| 5502 | 282.005 |
| 5503 | 283.005 |
| 5504 | 284.005 |
| 5505 | 285.005 |
| 5506 | 286.005 |
| 5507 | 282.755 |
| 5508 | 278.835 |
| 5509 | 275.795 |
| 5510 | 276.795 |
| 5511 | 277.795 |
| 5512 | 278.795 |
| 5513 | 279.795 |
| 5514 | 280.795 |
| 5515 | 281.795 |
| 5516 | 282.795 |
| 5517 | 283.795 |
| 5518 | 284.795 |
| 5519 | 285.795 |
| 5520 | 286.795 |
| 5521 | 287.795 |
| 5522 | 288.795 |
| 5523 | 289.795 |
| 5524 | 290.795 |
| 5525 | 291.795 |
| 5526 | 292.795 |
| 5527 | 293.795 |
| 5528 | 294.795 |
| 5529 | 295.795 |
| 5530 | 290.305 |
| 5531 | 291.305 |
| 5532 | 292.305 |
| 5533 | 293.305 |
| 5534 | 294.305 |
| 5535 | 295.305 |
| 5536 | 296.305 |
| 5537 | 297.305 |
| 5538 | 298.305 |
| 5539 | 299.305 |
| 5540 | 296.015 |
| 5541 | 297.015 |
| 5542 | 298.015 |
| 5543 | 299.015 |
| 5544 | 295.385 |
| 5545 | 296.385 |
| 5546 | 297.385 |
| 5547 | 298.385 |
| 5548 | 295.055 |
| 5549 | 296.055 |
| 5550 | 297.055 |
| 5551 | 298.055 |
| 5552 | 299.055 |
| 5553 | 300.055 |
| 5554 | 301.055 |
| 5555 | 302.055 |
| 5556 | 303.055 |
| 5557 | 304.055 |
| 5558 | 305.055 |
| 5559 | 306.055 |
| 5560 | 307.055 |
| 5561 | 303.845 |
| 5562 | 304.845 |
| 5563 | 305.845 |
| 5564 | 306.845 |
| 5565 | 307.845 |
| 5566 | 308.845 |
| 5567 | 309.845 |
| 5568 | 310.845 |
| 5569 | 306.985 |
| 5570 | 302.965 |
| 5571 | 303.965 |
| 5572 | 299.945 |
| 5573 | 300.945 |
| 5574 | 296.515 |
| 5575 | 297.515 |
| 5576 | 293.745 |
| 5577 | 294.775 |
| 5578 | 295.775 |
| 5579 | 296.775 |
| 5580 | 297.775 |
| 5581 | 298.775 |
| 5582 | 295.285 |
| 5583 | 296.285 |
| 5584 | 297.285 |
| 5585 | 298.285 |
| 5586 | 299.285 |
| 5587 | 300.285 |
| 5588 | 301.285 |
| 5589 | 302.285 |
| 5590 | 303.285 |
| 5591 | 304.285 |
| 5592 | 305.285 |
| 5593 | 306.285 |
| 5594 | 307.285 |
| 5595 | 308.285 |
| 5596 | 303.505 |
| 5597 | 304.525 |
| 5598 | 305.545 |
| 5599 | 306.545 |
| 5600 | 307.545 |
| 5601 | 298.595 |
| 5602 | 299.675 |
| 5603 | 300.675 |
| 5604 | 301.675 |
| 5605 | 302.675 |
| 5606 | 303.675 |
| 5607 | 304.675 |
| 5608 | 305.675 |
| 5609 | 306.675 |
| 5610 | 307.675 |
| 5611 | 308.675 |
| 5612 | 309.675 |
| 5613 | 310.675 |
| 5614 | 311.675 |
| 5615 | 312.675 |
| 5616 | 313.675 |
| 5617 | 314.675 |
| 5618 | 315.675 |
| 5619 | 316.675 |
| 5620 | 317.675 |
| 5621 | 318.675 |
| 5622 | 319.675 |
| 5623 | 312.46 |
| 5624 | 313.525 |
| 5625 | 308.565 |
| 5626 | 309.605 |
| 5627 | 310.605 |
| 5628 | 311.605 |
| 5629 | 312.605 |
| 5630 | 313.605 |
| 5631 | 314.605 |
| 5632 | 315.605 |
| 5633 | 310.655 |
| 5634 | 311.695 |
| 5635 | 312.695 |
| 5636 | 313.695 |
| 5637 | 314.695 |
| 5638 | 315.695 |
| 5639 | 316.695 |
| 5640 | 307.965 |
| 5641 | 309.045 |
| 5642 | 310.045 |
| 5643 | 311.045 |
| 5644 | 306.78 |
| 5645 | 307.815 |
| 5646 | 308.815 |
| 5647 | 309.815 |
| 5648 | 310.885 |
| 5649 | 311.955 |
| 5650 | 299.525 |
| 5651 | 300.525 |
| 5652 | 301.525 |
| 5653 | 302.525 |
| 5654 | 303.525 |
| 5655 | 304.59 |
| 5656 | 297.265 |
| 5657 | 298.265 |
| 5658 | 299.265 |
| 5659 | 300.265 |
| 5660 | 301.265 |
| 5661 | 302.265 |
| 5662 | 303.265 |
| 5663 | 304.265 |
| 5664 | 305.351 |
| 5665 | 306.437 |
| 5666 | 307.523 |
| 5667 | 282.289 |
| 5668 | 283.375 |
| 5669 | 284.407 |
| 5670 | 274.99 |
| 5671 | 276.022 |
| 5672 | 277.055 |
| 5673 | 267.63 |
| 5674 | 268.715 |
| 5675 | 269.715 |
| 5676 | 270.715 |
| 5677 | 271.715 |
| 5678 | 272.715 |
| 5679 | 273.715 |
| 5680 | 274.715 |
| 5681 | 275.715 |
| 5682 | 276.715 |
| 5683 | 277.715 |
| 5684 | 278.715 |
| 5685 | 279.715 |
| 5686 | 280.715 |
| 5687 | 281.715 |
| 5688 | 277.985 |
| 5689 | 278.995 |
| 5690 | 280.005 |
| 5691 | 281.005 |
| 5692 | 282.005 |
| 5693 | 283.005 |
| 5694 | 284.005 |
| 5695 | 285.005 |
| 5696 | 286.005 |
| 5697 | 287.005 |
| 5698 | 288.005 |
| 5699 | 289.005 |
| 5700 | 290.005 |
| 5701 | 291.058 |
| 5702 | 292.112 |
| 5703 | 282.195 |
| 5704 | 283.345 |
| 5705 | 267.495 |
| 5706 | 268.495 |
| 5707 | 269.495 |
| 5708 | 270.495 |
| 5709 | 271.495 |
| 5710 | 272.495 |
| 5711 | 273.495 |
| 5712 | 274.495 |
| 5713 | 275.495 |
| 5714 | 276.495 |
| 5715 | 268.475 |
| 5716 | 269.545 |
| 5717 | 270.545 |
| 5718 | 271.545 |
| 5719 | 272.545 |
| 5720 | 273.545 |
| 5721 | 274.545 |
| 5722 | 275.545 |
| 5723 | 276.545 |
| 5724 | 277.545 |
| 5725 | 278.545 |
| 5726 | 275.335 |
| 5727 | 276.355 |
| 5728 | 277.355 |
| 5729 | 278.355 |
| 5730 | 279.355 |
| 5731 | 280.355 |
| 5732 | 281.355 |
| 5733 | 282.355 |
| 5734 | 283.355 |
| 5735 | 284.355 |
| 5736 | 285.355 |
| 5737 | 286.355 |
| 5738 | 287.355 |
| 5739 | 278.788 |
| 5740 | 279.832 |
| 5741 | 280.875 |
| 5742 | 281.875 |
| 5743 | 282.875 |
| 5744 | 283.875 |
| 5745 | 280.465 |
| 5746 | 281.475 |
| 5747 | 282.485 |
| 5748 | 283.485 |
| 5749 | 284.485 |
| 5750 | 285.485 |
| 5751 | 286.485 |
| 5752 | 287.485 |
| 5753 | 288.485 |
| 5754 | 289.485 |
| 5755 | 290.485 |
| 5756 | 291.485 |
| 5757 | 292.485 |
| 5758 | 293.485 |
| 5759 | 294.485 |
| 5760 | 295.485 |
| 5761 | 296.485 |
| 5762 | 297.485 |
| 5763 | 298.485 |
| 5764 | 299.485 |
| 5765 | 300.485 |
| 5766 | 301.585 |
| 5767 | 290.495 |
| 5768 | 291.54 |
| 5769 | 286.185 |
| 5770 | 287.185 |
| 5771 | 288.185 |
| 5772 | 289.508 |
| 5773 | 290.832 |
| 5774 | 240.635 |
| 5775 | 241.635 |
| 5776 | 242.635 |
| 5777 | 243.635 |
| 5778 | 244.635 |
| 5779 | 245.635 |
| 5780 | 246.635 |
| 5781 | 247.635 |
| 5782 | 248.635 |
| 5783 | 249.635 |
| 5784 | 250.635 |
| 5785 | 251.635 |
| 5786 | 252.635 |
| 5787 | 253.635 |
| 5788 | 254.635 |
| 5789 | 255.635 |
| 5790 | 256.635 |
| 5791 | 257.635 |
| 5792 | 258.635 |
| 5793 | 259.635 |
| 5794 | 260.635 |
| 5795 | 261.635 |
| 5796 | 262.635 |
| 5797 | 263.635 |
| 5798 | 264.635 |
| 5799 | 265.635 |
| 5800 | 266.635 |
| 5801 | 267.635 |
| 5802 | 268.635 |
| 5803 | 269.635 |
| 5804 | 270.635 |
| 5805 | 271.635 |
| 5806 | 272.635 |
| 5807 | 273.635 |
| 5808 | 274.635 |
| 5809 | 275.635 |
| 5810 | 276.635 |
| 5811 | 277.635 |
| 5812 | 278.635 |
| 5813 | 279.635 |
| 5814 | 280.635 |
| 5815 | 281.635 |
| 5816 | 282.635 |
| 5817 | 283.635 |
| 5818 | 284.635 |
| 5819 | 285.635 |
| 5820 | 286.635 |
| 5821 | 287.635 |
| 5822 | 288.635 |
| 5823 | 289.635 |
| 5824 | 290.635 |
| 5825 | 291.635 |
| 5826 | 292.635 |
| 5827 | 293.635 |
| 5828 | 294.635 |
| 5829 | 295.635 |
| 5830 | 296.635 |
| 5831 | 297.635 |
| 5832 | 298.635 |
| 5833 | 299.635 |
| 5834 | 300.635 |
| 5835 | 301.635 |
| 5836 | 302.635 |
| 5837 | 303.635 |
| 5838 | 298.197 |
| 5839 | 299.21 |
| 5840 | 300.222 |
| 5841 | 301.235 |
| 5842 | 302.235 |
| 5843 | 303.235 |
| 5844 | 304.235 |
| 5845 | 305.235 |
| 5846 | 306.235 |
| 5847 | 307.235 |
| 5848 | 308.235 |
| 5849 | 309.235 |
| 5850 | 310.235 |
| 5851 | 311.235 |
| 5852 | 312.235 |
| 5853 | 313.235 |
| 5854 | 314.235 |
| 5855 | 315.235 |
| 5856 | 316.235 |
| 5857 | 317.235 |
| 5858 | 318.235 |
| 5859 | 319.235 |
| 5860 | 320.235 |
| 5861 | 321.235 |
| 5862 | 317.455 |
| 5863 | 318.485 |
| 5864 | 319.485 |
| 5865 | 320.485 |
| 5866 | 314.96 |
| 5867 | 316.005 |
| 5868 | 305.6 |
| 5869 | 306.695 |
| 5870 | 307.695 |
| 5871 | 308.695 |
| 5872 | 309.695 |
| 5873 | 310.695 |
| 5874 | 311.695 |
| 5875 | 312.695 |
| 5876 | 313.695 |
| 5877 | 314.695 |
| 5878 | 315.695 |
| 5879 | 316.695 |
| 5880 | 317.695 |
| 5881 | 318.695 |
| 5882 | 319.695 |
| 5883 | 320.695 |
| 5884 | 321.695 |
| 5885 | 322.695 |
| 5886 | 323.695 |
| 5887 | 324.695 |
| 5888 | 325.695 |
| 5889 | 326.695 |
| 5890 | 310.39 |
| 5891 | 311.545 |
| 5892 | 312.545 |
| 5893 | 313.545 |
| 5894 | 303.635 |
| 5895 | 304.725 |
| 5896 | 305.725 |
| 5897 | 306.725 |
| 5898 | 307.725 |
| 5899 | 308.792 |
| 5900 | 296.888 |
| 5901 | 297.955 |
| 5902 | 298.955 |
| 5903 | 299.955 |
| 5904 | 300.955 |
| 5905 | 301.955 |
| 5906 | 302.955 |
| 5907 | 303.955 |
| 5908 | 304.955 |
| 5909 | 305.955 |
| 5910 | 306.955 |
| 5911 | 307.955 |
| 5912 | 308.955 |
| 5913 | 309.955 |
| 5914 | 310.955 |
| 5915 | 311.955 |
| 5916 | 312.955 |
| 5917 | 313.955 |
| 5918 | 314.955 |
| 5919 | 315.955 |
| 5920 | 316.955 |
| 5921 | 317.955 |
| 5922 | 319.002 |
| 5923 | 309.858 |
| 5924 | 310.905 |
| 5925 | 311.97 |
| 5926 | 313.035 |
| 5927 | 297.2 |
| 5928 | 298.265 |
| 5929 | 299.265 |
| 5930 | 300.265 |
| 5931 | 290.515 |
| 5932 | 291.605 |
| 5933 | 292.605 |
| 5934 | 293.605 |
| 5935 | 294.605 |
| 5936 | 290.212 |
| 5937 | 291.22 |
| 5938 | 292.227 |
| 5939 | 293.235 |
| 5940 | 294.235 |
| 5941 | 295.235 |
| 5942 | 296.235 |
| 5943 | 297.235 |
| 5944 | 298.235 |
| 5945 | 299.235 |
| 5946 | 300.235 |
| 5947 | 301.235 |
| 5948 | 302.235 |
| 5949 | 303.235 |
| 5950 | 304.283 |
| 5951 | 305.331 |
| 5952 | 306.379 |
| 5953 | 290.427 |
| 5954 | 291.475 |
| 5955 | 292.475 |
| 5956 | 293.475 |
| 5957 | 294.475 |
| 5958 | 295.475 |
| 5959 | 296.475 |
| 5960 | 297.475 |
| 5961 | 298.475 |
| 5962 | 299.475 |
| 5963 | 300.475 |
| 5964 | 301.475 |
| 5965 | 302.475 |
| 5966 | 303.475 |
| 5967 | 304.475 |
| 5968 | 305.475 |
| 5969 | 306.475 |
| 5970 | 307.475 |
| 5971 | 308.475 |
| 5972 | 309.475 |
| 5973 | 310.475 |
| 5974 | 311.475 |
| 5975 | 312.475 |
| 5976 | 313.475 |
| 5977 | 314.475 |
| 5978 | 309.335 |
| 5979 | 310.335 |
| 5980 | 305.695 |
| 5981 | 306.695 |
| 5982 | 307.695 |
| 5983 | 301.815 |
| 5984 | 302.815 |
| 5985 | 296.435 |
| 5986 | 297.435 |
| 5987 | 298.435 |
| 5988 | 299.435 |
| 5989 | 300.435 |
| 5990 | 301.435 |
| 5991 | 302.435 |
| 5992 | 303.435 |
| 5993 | 304.435 |
| 5994 | 305.435 |
| 5995 | 306.435 |
| 5996 | 307.435 |
| 5997 | 300.795 |
| 5998 | 295.505 |
| 5999 | 296.505 |
| 6000 | 297.505 |
| 6001 | 292.535 |
| 6002 | 293.535 |
| 6003 | 294.535 |
| 6004 | 295.535 |
| 6005 | 296.535 |
| 6006 | 297.535 |
| 6007 | 298.535 |
| 6008 | 299.535 |
| 6009 | 300.535 |
| 6010 | 301.535 |
| 6011 | 302.535 |
| 6012 | 303.535 |
| 6013 | 304.535 |
| 6014 | 305.535 |
| 6015 | 306.535 |
| 6016 | 300.025 |
| 6017 | 301.025 |
| 6018 | 302.025 |
| 6019 | 303.025 |
| 6020 | 304.025 |
| 6021 | 305.025 |
| 6022 | 300.185 |
| 6023 | 293.255 |
| 6024 | 294.255 |
| 6025 | 295.255 |
| 6026 | 289.475 |
| 6027 | 290.475 |
| 6028 | 291.475 |
| 6029 | 292.475 |
| 6030 | 293.475 |
| 6031 | 294.475 |
| 6032 | 295.475 |
| 6033 | 289.985 |
| 6034 | 290.985 |
| 6035 | 291.985 |
| 6036 | 292.985 |
| 6037 | 287.985 |
| 6038 | 288.985 |
| 6039 | 289.985 |
| 6040 | 290.985 |
| 6041 | 291.985 |
| 6042 | 292.985 |
| 6043 | 293.985 |
| 6044 | 294.985 |
| 6045 | 295.985 |
| 6046 | 290.075 |
| 6047 | 291.075 |
| 6048 | 292.075 |
| 6049 | 293.075 |
| 6050 | 294.075 |
| 6051 | 295.075 |
| 6052 | 287.025 |
| 6053 | 288.025 |
| 6054 | 289.025 |
| 6055 | 290.025 |
| 6056 | 291.025 |
| 6057 | 284.365 |
| 6058 | 285.365 |
| 6059 | 286.365 |
| 6060 | 287.365 |
| 6061 | 288.365 |
| 6062 | 289.365 |
| 6063 | 290.365 |
| 6064 | 291.365 |
| 6065 | 292.365 |
| 6066 | 293.365 |
| 6067 | 294.365 |
| 6068 | 295.365 |
| 6069 | 290.075 |
| 6070 | 291.075 |
| 6071 | 292.075 |
| 6072 | 293.075 |
| 6073 | 294.075 |
| 6074 | 295.075 |
| 6075 | 288.345 |
| 6076 | 289.345 |
| 6077 | 290.345 |
| 6078 | 291.345 |
| 6079 | 292.345 |
| 6080 | 293.345 |
| 6081 | 287.565 |
| 6082 | 288.565 |
| 6083 | 289.565 |
| 6084 | 290.565 |
| 6085 | 291.565 |
| 6086 | 292.565 |
| 6087 | 293.565 |
| 6088 | 294.565 |
| 6089 | 295.565 |
| 6090 | 296.565 |
| 6091 | 297.565 |
| 6092 | 291.685 |
| 6093 | 292.685 |
| 6094 | 286.965 |
| 6095 | 287.965 |
| 6096 | 288.965 |
| 6097 | 281.555 |
| 6098 | 282.555 |
| 6099 | 283.555 |
| 6100 | 284.555 |
| 6101 | 285.555 |
| 6102 | 286.555 |
| 6103 | 280.125 |
| 6104 | 281.125 |
| 6105 | 282.125 |
| 6106 | 283.125 |
| 6107 | 278.285 |
| 6108 | 279.285 |
| 6109 | 280.285 |
| 6110 | 281.285 |
| 6111 | 282.285 |
| 6112 | 283.285 |
| 6113 | 284.285 |
| 6114 | 275.665 |
| 6115 | 276.665 |
| 6116 | 277.665 |
| 6117 | 271.785 |
| 6118 | 272.785 |
| 6119 | 273.785 |
| 6120 | 274.785 |
| 6121 | 275.785 |
| 6122 | 276.785 |
| 6123 | 277.805 |
| 6124 | 278.805 |
| 6125 | 279.805 |
| 6126 | 280.805 |
| 6127 | 281.805 |
| 6128 | 282.805 |
| 6129 | 283.805 |
| 6130 | 284.805 |
| 6131 | 285.805 |
| 6132 | 286.805 |
| 6133 | 287.805 |
| 6134 | 288.805 |
| 6135 | 289.805 |
| 6136 | 290.805 |
| 6137 | 291.805 |
| 6138 | 292.805 |